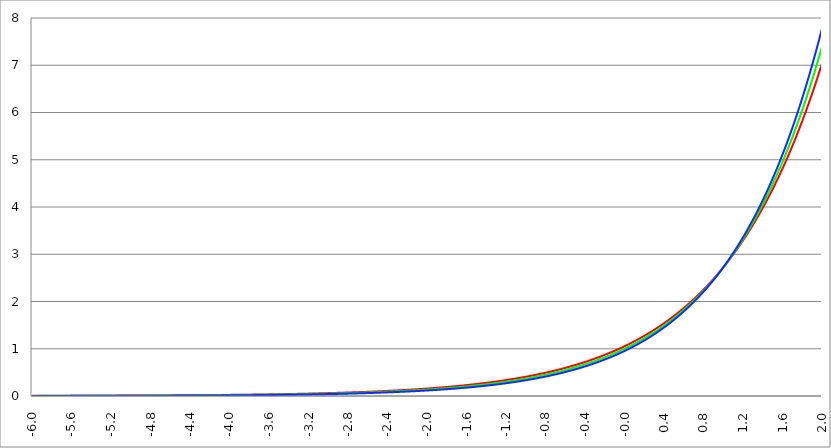
| Category | Series 1 | Series 0 | Series 2 |
|---|---|---|---|
| -6.0 | 0.004 | 0.002 | 0.002 |
| -5.996 | 0.004 | 0.002 | 0.002 |
| -5.992000000000001 | 0.004 | 0.002 | 0.002 |
| -5.988000000000001 | 0.004 | 0.003 | 0.002 |
| -5.984000000000002 | 0.004 | 0.003 | 0.002 |
| -5.980000000000002 | 0.004 | 0.003 | 0.002 |
| -5.976000000000002 | 0.004 | 0.003 | 0.002 |
| -5.972000000000003 | 0.004 | 0.003 | 0.002 |
| -5.968000000000003 | 0.004 | 0.003 | 0.002 |
| -5.964000000000004 | 0.004 | 0.003 | 0.002 |
| -5.960000000000004 | 0.004 | 0.003 | 0.002 |
| -5.956000000000004 | 0.004 | 0.003 | 0.002 |
| -5.952000000000005 | 0.004 | 0.003 | 0.002 |
| -5.948000000000005 | 0.004 | 0.003 | 0.002 |
| -5.944000000000006 | 0.004 | 0.003 | 0.002 |
| -5.940000000000006 | 0.004 | 0.003 | 0.002 |
| -5.936000000000007 | 0.004 | 0.003 | 0.002 |
| -5.932000000000007 | 0.004 | 0.003 | 0.002 |
| -5.928000000000008 | 0.004 | 0.003 | 0.002 |
| -5.924000000000008 | 0.004 | 0.003 | 0.002 |
| -5.920000000000009 | 0.004 | 0.003 | 0.002 |
| -5.91600000000001 | 0.004 | 0.003 | 0.002 |
| -5.91200000000001 | 0.004 | 0.003 | 0.002 |
| -5.90800000000001 | 0.004 | 0.003 | 0.002 |
| -5.904000000000011 | 0.004 | 0.003 | 0.002 |
| -5.900000000000011 | 0.004 | 0.003 | 0.002 |
| -5.896000000000011 | 0.004 | 0.003 | 0.002 |
| -5.892000000000012 | 0.004 | 0.003 | 0.002 |
| -5.888000000000012 | 0.004 | 0.003 | 0.002 |
| -5.884000000000013 | 0.004 | 0.003 | 0.002 |
| -5.880000000000013 | 0.004 | 0.003 | 0.002 |
| -5.876000000000014 | 0.004 | 0.003 | 0.002 |
| -5.872000000000014 | 0.004 | 0.003 | 0.002 |
| -5.868000000000014 | 0.004 | 0.003 | 0.002 |
| -5.864000000000015 | 0.004 | 0.003 | 0.002 |
| -5.860000000000015 | 0.004 | 0.003 | 0.002 |
| -5.856000000000016 | 0.004 | 0.003 | 0.002 |
| -5.852000000000016 | 0.004 | 0.003 | 0.002 |
| -5.848000000000017 | 0.004 | 0.003 | 0.002 |
| -5.844000000000017 | 0.004 | 0.003 | 0.002 |
| -5.840000000000018 | 0.004 | 0.003 | 0.002 |
| -5.836000000000018 | 0.004 | 0.003 | 0.002 |
| -5.832000000000018 | 0.004 | 0.003 | 0.002 |
| -5.828000000000019 | 0.004 | 0.003 | 0.002 |
| -5.824000000000019 | 0.004 | 0.003 | 0.002 |
| -5.82000000000002 | 0.004 | 0.003 | 0.002 |
| -5.81600000000002 | 0.004 | 0.003 | 0.002 |
| -5.812000000000021 | 0.004 | 0.003 | 0.002 |
| -5.808000000000021 | 0.004 | 0.003 | 0.002 |
| -5.804000000000022 | 0.004 | 0.003 | 0.002 |
| -5.800000000000022 | 0.004 | 0.003 | 0.002 |
| -5.796000000000022 | 0.004 | 0.003 | 0.002 |
| -5.792000000000023 | 0.004 | 0.003 | 0.002 |
| -5.788000000000023 | 0.004 | 0.003 | 0.002 |
| -5.784000000000024 | 0.004 | 0.003 | 0.002 |
| -5.780000000000024 | 0.004 | 0.003 | 0.002 |
| -5.776000000000024 | 0.004 | 0.003 | 0.002 |
| -5.772000000000025 | 0.004 | 0.003 | 0.002 |
| -5.768000000000025 | 0.004 | 0.003 | 0.002 |
| -5.764000000000026 | 0.004 | 0.003 | 0.002 |
| -5.760000000000026 | 0.004 | 0.003 | 0.002 |
| -5.756000000000026 | 0.004 | 0.003 | 0.002 |
| -5.752000000000027 | 0.004 | 0.003 | 0.002 |
| -5.748000000000027 | 0.004 | 0.003 | 0.002 |
| -5.744000000000028 | 0.004 | 0.003 | 0.002 |
| -5.740000000000028 | 0.005 | 0.003 | 0.002 |
| -5.73600000000003 | 0.005 | 0.003 | 0.002 |
| -5.73200000000003 | 0.005 | 0.003 | 0.002 |
| -5.72800000000003 | 0.005 | 0.003 | 0.002 |
| -5.72400000000003 | 0.005 | 0.003 | 0.002 |
| -5.720000000000031 | 0.005 | 0.003 | 0.002 |
| -5.716000000000031 | 0.005 | 0.003 | 0.002 |
| -5.712000000000032 | 0.005 | 0.003 | 0.002 |
| -5.708000000000032 | 0.005 | 0.003 | 0.002 |
| -5.704000000000033 | 0.005 | 0.003 | 0.002 |
| -5.700000000000033 | 0.005 | 0.003 | 0.002 |
| -5.696000000000033 | 0.005 | 0.003 | 0.002 |
| -5.692000000000034 | 0.005 | 0.003 | 0.002 |
| -5.688000000000034 | 0.005 | 0.003 | 0.002 |
| -5.684000000000035 | 0.005 | 0.003 | 0.002 |
| -5.680000000000035 | 0.005 | 0.003 | 0.002 |
| -5.676000000000035 | 0.005 | 0.003 | 0.002 |
| -5.672000000000036 | 0.005 | 0.003 | 0.002 |
| -5.668000000000036 | 0.005 | 0.003 | 0.002 |
| -5.664000000000037 | 0.005 | 0.003 | 0.002 |
| -5.660000000000037 | 0.005 | 0.003 | 0.002 |
| -5.656000000000038 | 0.005 | 0.003 | 0.003 |
| -5.652000000000038 | 0.005 | 0.004 | 0.003 |
| -5.648000000000039 | 0.005 | 0.004 | 0.003 |
| -5.644000000000039 | 0.005 | 0.004 | 0.003 |
| -5.64000000000004 | 0.005 | 0.004 | 0.003 |
| -5.63600000000004 | 0.005 | 0.004 | 0.003 |
| -5.63200000000004 | 0.005 | 0.004 | 0.003 |
| -5.628000000000041 | 0.005 | 0.004 | 0.003 |
| -5.624000000000041 | 0.005 | 0.004 | 0.003 |
| -5.620000000000042 | 0.005 | 0.004 | 0.003 |
| -5.616000000000042 | 0.005 | 0.004 | 0.003 |
| -5.612000000000043 | 0.005 | 0.004 | 0.003 |
| -5.608000000000043 | 0.005 | 0.004 | 0.003 |
| -5.604000000000044 | 0.005 | 0.004 | 0.003 |
| -5.600000000000044 | 0.005 | 0.004 | 0.003 |
| -5.596000000000044 | 0.005 | 0.004 | 0.003 |
| -5.592000000000045 | 0.005 | 0.004 | 0.003 |
| -5.588000000000045 | 0.005 | 0.004 | 0.003 |
| -5.584000000000046 | 0.005 | 0.004 | 0.003 |
| -5.580000000000046 | 0.005 | 0.004 | 0.003 |
| -5.576000000000046 | 0.005 | 0.004 | 0.003 |
| -5.572000000000047 | 0.005 | 0.004 | 0.003 |
| -5.568000000000048 | 0.005 | 0.004 | 0.003 |
| -5.564000000000048 | 0.005 | 0.004 | 0.003 |
| -5.560000000000048 | 0.005 | 0.004 | 0.003 |
| -5.556000000000049 | 0.005 | 0.004 | 0.003 |
| -5.552000000000049 | 0.005 | 0.004 | 0.003 |
| -5.54800000000005 | 0.005 | 0.004 | 0.003 |
| -5.54400000000005 | 0.005 | 0.004 | 0.003 |
| -5.540000000000051 | 0.005 | 0.004 | 0.003 |
| -5.536000000000051 | 0.005 | 0.004 | 0.003 |
| -5.532000000000052 | 0.005 | 0.004 | 0.003 |
| -5.528000000000052 | 0.006 | 0.004 | 0.003 |
| -5.524000000000052 | 0.006 | 0.004 | 0.003 |
| -5.520000000000053 | 0.006 | 0.004 | 0.003 |
| -5.516000000000053 | 0.006 | 0.004 | 0.003 |
| -5.512000000000054 | 0.006 | 0.004 | 0.003 |
| -5.508000000000054 | 0.006 | 0.004 | 0.003 |
| -5.504000000000055 | 0.006 | 0.004 | 0.003 |
| -5.500000000000055 | 0.006 | 0.004 | 0.003 |
| -5.496000000000055 | 0.006 | 0.004 | 0.003 |
| -5.492000000000056 | 0.006 | 0.004 | 0.003 |
| -5.488000000000056 | 0.006 | 0.004 | 0.003 |
| -5.484000000000057 | 0.006 | 0.004 | 0.003 |
| -5.480000000000057 | 0.006 | 0.004 | 0.003 |
| -5.476000000000057 | 0.006 | 0.004 | 0.003 |
| -5.472000000000058 | 0.006 | 0.004 | 0.003 |
| -5.468000000000059 | 0.006 | 0.004 | 0.003 |
| -5.464000000000059 | 0.006 | 0.004 | 0.003 |
| -5.460000000000059 | 0.006 | 0.004 | 0.003 |
| -5.45600000000006 | 0.006 | 0.004 | 0.003 |
| -5.45200000000006 | 0.006 | 0.004 | 0.003 |
| -5.44800000000006 | 0.006 | 0.004 | 0.003 |
| -5.444000000000061 | 0.006 | 0.004 | 0.003 |
| -5.440000000000061 | 0.006 | 0.004 | 0.003 |
| -5.436000000000062 | 0.006 | 0.004 | 0.003 |
| -5.432000000000062 | 0.006 | 0.004 | 0.003 |
| -5.428000000000063 | 0.006 | 0.004 | 0.003 |
| -5.424000000000063 | 0.006 | 0.004 | 0.003 |
| -5.420000000000064 | 0.006 | 0.004 | 0.003 |
| -5.416000000000064 | 0.006 | 0.004 | 0.003 |
| -5.412000000000064 | 0.006 | 0.004 | 0.003 |
| -5.408000000000065 | 0.006 | 0.004 | 0.003 |
| -5.404000000000065 | 0.006 | 0.004 | 0.003 |
| -5.400000000000066 | 0.006 | 0.005 | 0.003 |
| -5.396000000000066 | 0.006 | 0.005 | 0.003 |
| -5.392000000000067 | 0.006 | 0.005 | 0.003 |
| -5.388000000000067 | 0.006 | 0.005 | 0.003 |
| -5.384000000000068 | 0.006 | 0.005 | 0.003 |
| -5.380000000000068 | 0.006 | 0.005 | 0.003 |
| -5.376000000000068 | 0.006 | 0.005 | 0.003 |
| -5.37200000000007 | 0.006 | 0.005 | 0.003 |
| -5.36800000000007 | 0.006 | 0.005 | 0.003 |
| -5.36400000000007 | 0.006 | 0.005 | 0.003 |
| -5.36000000000007 | 0.006 | 0.005 | 0.003 |
| -5.356000000000071 | 0.006 | 0.005 | 0.003 |
| -5.352000000000071 | 0.007 | 0.005 | 0.003 |
| -5.348000000000072 | 0.007 | 0.005 | 0.003 |
| -5.344000000000072 | 0.007 | 0.005 | 0.003 |
| -5.340000000000073 | 0.007 | 0.005 | 0.003 |
| -5.336000000000073 | 0.007 | 0.005 | 0.004 |
| -5.332000000000074 | 0.007 | 0.005 | 0.004 |
| -5.328000000000074 | 0.007 | 0.005 | 0.004 |
| -5.324000000000074 | 0.007 | 0.005 | 0.004 |
| -5.320000000000075 | 0.007 | 0.005 | 0.004 |
| -5.316000000000075 | 0.007 | 0.005 | 0.004 |
| -5.312000000000076 | 0.007 | 0.005 | 0.004 |
| -5.308000000000076 | 0.007 | 0.005 | 0.004 |
| -5.304000000000077 | 0.007 | 0.005 | 0.004 |
| -5.300000000000077 | 0.007 | 0.005 | 0.004 |
| -5.296000000000077 | 0.007 | 0.005 | 0.004 |
| -5.292000000000078 | 0.007 | 0.005 | 0.004 |
| -5.288000000000078 | 0.007 | 0.005 | 0.004 |
| -5.284000000000079 | 0.007 | 0.005 | 0.004 |
| -5.28000000000008 | 0.007 | 0.005 | 0.004 |
| -5.27600000000008 | 0.007 | 0.005 | 0.004 |
| -5.27200000000008 | 0.007 | 0.005 | 0.004 |
| -5.268000000000081 | 0.007 | 0.005 | 0.004 |
| -5.264000000000081 | 0.007 | 0.005 | 0.004 |
| -5.260000000000081 | 0.007 | 0.005 | 0.004 |
| -5.256000000000082 | 0.007 | 0.005 | 0.004 |
| -5.252000000000082 | 0.007 | 0.005 | 0.004 |
| -5.248000000000083 | 0.007 | 0.005 | 0.004 |
| -5.244000000000083 | 0.007 | 0.005 | 0.004 |
| -5.240000000000084 | 0.007 | 0.005 | 0.004 |
| -5.236000000000084 | 0.007 | 0.005 | 0.004 |
| -5.232000000000084 | 0.007 | 0.005 | 0.004 |
| -5.228000000000085 | 0.007 | 0.005 | 0.004 |
| -5.224000000000085 | 0.007 | 0.005 | 0.004 |
| -5.220000000000086 | 0.007 | 0.005 | 0.004 |
| -5.216000000000086 | 0.007 | 0.005 | 0.004 |
| -5.212000000000087 | 0.007 | 0.005 | 0.004 |
| -5.208000000000087 | 0.007 | 0.005 | 0.004 |
| -5.204000000000088 | 0.008 | 0.005 | 0.004 |
| -5.200000000000088 | 0.008 | 0.006 | 0.004 |
| -5.196000000000089 | 0.008 | 0.006 | 0.004 |
| -5.192000000000089 | 0.008 | 0.006 | 0.004 |
| -5.188000000000089 | 0.008 | 0.006 | 0.004 |
| -5.18400000000009 | 0.008 | 0.006 | 0.004 |
| -5.18000000000009 | 0.008 | 0.006 | 0.004 |
| -5.176000000000091 | 0.008 | 0.006 | 0.004 |
| -5.172000000000091 | 0.008 | 0.006 | 0.004 |
| -5.168000000000092 | 0.008 | 0.006 | 0.004 |
| -5.164000000000092 | 0.008 | 0.006 | 0.004 |
| -5.160000000000092 | 0.008 | 0.006 | 0.004 |
| -5.156000000000093 | 0.008 | 0.006 | 0.004 |
| -5.152000000000093 | 0.008 | 0.006 | 0.004 |
| -5.148000000000094 | 0.008 | 0.006 | 0.004 |
| -5.144000000000094 | 0.008 | 0.006 | 0.004 |
| -5.140000000000095 | 0.008 | 0.006 | 0.004 |
| -5.136000000000095 | 0.008 | 0.006 | 0.004 |
| -5.132000000000096 | 0.008 | 0.006 | 0.004 |
| -5.128000000000096 | 0.008 | 0.006 | 0.004 |
| -5.124000000000096 | 0.008 | 0.006 | 0.004 |
| -5.120000000000097 | 0.008 | 0.006 | 0.004 |
| -5.116000000000097 | 0.008 | 0.006 | 0.004 |
| -5.112000000000098 | 0.008 | 0.006 | 0.004 |
| -5.108000000000098 | 0.008 | 0.006 | 0.004 |
| -5.104000000000099 | 0.008 | 0.006 | 0.004 |
| -5.100000000000099 | 0.008 | 0.006 | 0.004 |
| -5.0960000000001 | 0.008 | 0.006 | 0.005 |
| -5.0920000000001 | 0.008 | 0.006 | 0.005 |
| -5.0880000000001 | 0.008 | 0.006 | 0.005 |
| -5.084000000000101 | 0.008 | 0.006 | 0.005 |
| -5.080000000000101 | 0.008 | 0.006 | 0.005 |
| -5.076000000000101 | 0.008 | 0.006 | 0.005 |
| -5.072000000000102 | 0.009 | 0.006 | 0.005 |
| -5.068000000000103 | 0.009 | 0.006 | 0.005 |
| -5.064000000000103 | 0.009 | 0.006 | 0.005 |
| -5.060000000000104 | 0.009 | 0.006 | 0.005 |
| -5.056000000000104 | 0.009 | 0.006 | 0.005 |
| -5.052000000000104 | 0.009 | 0.006 | 0.005 |
| -5.048000000000104 | 0.009 | 0.006 | 0.005 |
| -5.044000000000105 | 0.009 | 0.006 | 0.005 |
| -5.040000000000105 | 0.009 | 0.006 | 0.005 |
| -5.036000000000106 | 0.009 | 0.006 | 0.005 |
| -5.032000000000106 | 0.009 | 0.007 | 0.005 |
| -5.028000000000107 | 0.009 | 0.007 | 0.005 |
| -5.024000000000107 | 0.009 | 0.007 | 0.005 |
| -5.020000000000108 | 0.009 | 0.007 | 0.005 |
| -5.016000000000108 | 0.009 | 0.007 | 0.005 |
| -5.012000000000109 | 0.009 | 0.007 | 0.005 |
| -5.00800000000011 | 0.009 | 0.007 | 0.005 |
| -5.00400000000011 | 0.009 | 0.007 | 0.005 |
| -5.00000000000011 | 0.009 | 0.007 | 0.005 |
| -4.99600000000011 | 0.009 | 0.007 | 0.005 |
| -4.992000000000111 | 0.009 | 0.007 | 0.005 |
| -4.988000000000111 | 0.009 | 0.007 | 0.005 |
| -4.984000000000112 | 0.009 | 0.007 | 0.005 |
| -4.980000000000112 | 0.009 | 0.007 | 0.005 |
| -4.976000000000112 | 0.009 | 0.007 | 0.005 |
| -4.972000000000113 | 0.009 | 0.007 | 0.005 |
| -4.968000000000114 | 0.009 | 0.007 | 0.005 |
| -4.964000000000114 | 0.009 | 0.007 | 0.005 |
| -4.960000000000114 | 0.009 | 0.007 | 0.005 |
| -4.956000000000114 | 0.009 | 0.007 | 0.005 |
| -4.952000000000115 | 0.01 | 0.007 | 0.005 |
| -4.948000000000115 | 0.01 | 0.007 | 0.005 |
| -4.944000000000116 | 0.01 | 0.007 | 0.005 |
| -4.940000000000116 | 0.01 | 0.007 | 0.005 |
| -4.936000000000117 | 0.01 | 0.007 | 0.005 |
| -4.932000000000117 | 0.01 | 0.007 | 0.005 |
| -4.928000000000118 | 0.01 | 0.007 | 0.005 |
| -4.924000000000118 | 0.01 | 0.007 | 0.005 |
| -4.920000000000119 | 0.01 | 0.007 | 0.005 |
| -4.91600000000012 | 0.01 | 0.007 | 0.005 |
| -4.91200000000012 | 0.01 | 0.007 | 0.005 |
| -4.90800000000012 | 0.01 | 0.007 | 0.006 |
| -4.90400000000012 | 0.01 | 0.007 | 0.006 |
| -4.90000000000012 | 0.01 | 0.007 | 0.006 |
| -4.896000000000121 | 0.01 | 0.007 | 0.006 |
| -4.892000000000122 | 0.01 | 0.008 | 0.006 |
| -4.888000000000122 | 0.01 | 0.008 | 0.006 |
| -4.884000000000123 | 0.01 | 0.008 | 0.006 |
| -4.880000000000123 | 0.01 | 0.008 | 0.006 |
| -4.876000000000123 | 0.01 | 0.008 | 0.006 |
| -4.872000000000124 | 0.01 | 0.008 | 0.006 |
| -4.868000000000124 | 0.01 | 0.008 | 0.006 |
| -4.864000000000125 | 0.01 | 0.008 | 0.006 |
| -4.860000000000125 | 0.01 | 0.008 | 0.006 |
| -4.856000000000125 | 0.01 | 0.008 | 0.006 |
| -4.852000000000126 | 0.01 | 0.008 | 0.006 |
| -4.848000000000126 | 0.011 | 0.008 | 0.006 |
| -4.844000000000127 | 0.011 | 0.008 | 0.006 |
| -4.840000000000127 | 0.011 | 0.008 | 0.006 |
| -4.836000000000128 | 0.011 | 0.008 | 0.006 |
| -4.832000000000128 | 0.011 | 0.008 | 0.006 |
| -4.82800000000013 | 0.011 | 0.008 | 0.006 |
| -4.824000000000129 | 0.011 | 0.008 | 0.006 |
| -4.82000000000013 | 0.011 | 0.008 | 0.006 |
| -4.81600000000013 | 0.011 | 0.008 | 0.006 |
| -4.812000000000131 | 0.011 | 0.008 | 0.006 |
| -4.808000000000131 | 0.011 | 0.008 | 0.006 |
| -4.804000000000132 | 0.011 | 0.008 | 0.006 |
| -4.800000000000132 | 0.011 | 0.008 | 0.006 |
| -4.796000000000132 | 0.011 | 0.008 | 0.006 |
| -4.792000000000133 | 0.011 | 0.008 | 0.006 |
| -4.788000000000133 | 0.011 | 0.008 | 0.006 |
| -4.784000000000134 | 0.011 | 0.008 | 0.006 |
| -4.780000000000134 | 0.011 | 0.008 | 0.006 |
| -4.776000000000134 | 0.011 | 0.008 | 0.006 |
| -4.772000000000135 | 0.011 | 0.008 | 0.006 |
| -4.768000000000135 | 0.011 | 0.008 | 0.006 |
| -4.764000000000136 | 0.011 | 0.009 | 0.006 |
| -4.760000000000136 | 0.011 | 0.009 | 0.006 |
| -4.756000000000136 | 0.011 | 0.009 | 0.006 |
| -4.752000000000137 | 0.012 | 0.009 | 0.006 |
| -4.748000000000137 | 0.012 | 0.009 | 0.007 |
| -4.744000000000138 | 0.012 | 0.009 | 0.007 |
| -4.740000000000138 | 0.012 | 0.009 | 0.007 |
| -4.73600000000014 | 0.012 | 0.009 | 0.007 |
| -4.73200000000014 | 0.012 | 0.009 | 0.007 |
| -4.72800000000014 | 0.012 | 0.009 | 0.007 |
| -4.72400000000014 | 0.012 | 0.009 | 0.007 |
| -4.720000000000141 | 0.012 | 0.009 | 0.007 |
| -4.716000000000141 | 0.012 | 0.009 | 0.007 |
| -4.712000000000142 | 0.012 | 0.009 | 0.007 |
| -4.708000000000142 | 0.012 | 0.009 | 0.007 |
| -4.704000000000143 | 0.012 | 0.009 | 0.007 |
| -4.700000000000143 | 0.012 | 0.009 | 0.007 |
| -4.696000000000143 | 0.012 | 0.009 | 0.007 |
| -4.692000000000144 | 0.012 | 0.009 | 0.007 |
| -4.688000000000144 | 0.012 | 0.009 | 0.007 |
| -4.684000000000145 | 0.012 | 0.009 | 0.007 |
| -4.680000000000145 | 0.012 | 0.009 | 0.007 |
| -4.676000000000145 | 0.012 | 0.009 | 0.007 |
| -4.672000000000146 | 0.012 | 0.009 | 0.007 |
| -4.668000000000147 | 0.012 | 0.009 | 0.007 |
| -4.664000000000147 | 0.013 | 0.009 | 0.007 |
| -4.660000000000147 | 0.013 | 0.009 | 0.007 |
| -4.656000000000148 | 0.013 | 0.01 | 0.007 |
| -4.652000000000148 | 0.013 | 0.01 | 0.007 |
| -4.648000000000149 | 0.013 | 0.01 | 0.007 |
| -4.644000000000149 | 0.013 | 0.01 | 0.007 |
| -4.64000000000015 | 0.013 | 0.01 | 0.007 |
| -4.63600000000015 | 0.013 | 0.01 | 0.007 |
| -4.632000000000151 | 0.013 | 0.01 | 0.007 |
| -4.628000000000151 | 0.013 | 0.01 | 0.007 |
| -4.624000000000151 | 0.013 | 0.01 | 0.007 |
| -4.620000000000152 | 0.013 | 0.01 | 0.007 |
| -4.616000000000152 | 0.013 | 0.01 | 0.007 |
| -4.612000000000153 | 0.013 | 0.01 | 0.008 |
| -4.608000000000153 | 0.013 | 0.01 | 0.008 |
| -4.604000000000154 | 0.013 | 0.01 | 0.008 |
| -4.600000000000154 | 0.013 | 0.01 | 0.008 |
| -4.596000000000154 | 0.013 | 0.01 | 0.008 |
| -4.592000000000155 | 0.013 | 0.01 | 0.008 |
| -4.588000000000155 | 0.013 | 0.01 | 0.008 |
| -4.584000000000156 | 0.014 | 0.01 | 0.008 |
| -4.580000000000156 | 0.014 | 0.01 | 0.008 |
| -4.576000000000156 | 0.014 | 0.01 | 0.008 |
| -4.572000000000157 | 0.014 | 0.01 | 0.008 |
| -4.568000000000158 | 0.014 | 0.01 | 0.008 |
| -4.564000000000158 | 0.014 | 0.01 | 0.008 |
| -4.560000000000159 | 0.014 | 0.01 | 0.008 |
| -4.55600000000016 | 0.014 | 0.011 | 0.008 |
| -4.552000000000159 | 0.014 | 0.011 | 0.008 |
| -4.54800000000016 | 0.014 | 0.011 | 0.008 |
| -4.54400000000016 | 0.014 | 0.011 | 0.008 |
| -4.54000000000016 | 0.014 | 0.011 | 0.008 |
| -4.53600000000016 | 0.014 | 0.011 | 0.008 |
| -4.532000000000161 | 0.014 | 0.011 | 0.008 |
| -4.528000000000162 | 0.014 | 0.011 | 0.008 |
| -4.524000000000163 | 0.014 | 0.011 | 0.008 |
| -4.520000000000163 | 0.014 | 0.011 | 0.008 |
| -4.516000000000163 | 0.014 | 0.011 | 0.008 |
| -4.512000000000164 | 0.014 | 0.011 | 0.008 |
| -4.508000000000164 | 0.015 | 0.011 | 0.008 |
| -4.504000000000164 | 0.015 | 0.011 | 0.008 |
| -4.500000000000165 | 0.015 | 0.011 | 0.008 |
| -4.496000000000165 | 0.015 | 0.011 | 0.008 |
| -4.492000000000166 | 0.015 | 0.011 | 0.009 |
| -4.488000000000166 | 0.015 | 0.011 | 0.009 |
| -4.484000000000166 | 0.015 | 0.011 | 0.009 |
| -4.480000000000167 | 0.015 | 0.011 | 0.009 |
| -4.476000000000167 | 0.015 | 0.011 | 0.009 |
| -4.472000000000168 | 0.015 | 0.011 | 0.009 |
| -4.468000000000168 | 0.015 | 0.011 | 0.009 |
| -4.46400000000017 | 0.015 | 0.012 | 0.009 |
| -4.46000000000017 | 0.015 | 0.012 | 0.009 |
| -4.45600000000017 | 0.015 | 0.012 | 0.009 |
| -4.45200000000017 | 0.015 | 0.012 | 0.009 |
| -4.44800000000017 | 0.015 | 0.012 | 0.009 |
| -4.444000000000171 | 0.015 | 0.012 | 0.009 |
| -4.440000000000171 | 0.016 | 0.012 | 0.009 |
| -4.436000000000172 | 0.016 | 0.012 | 0.009 |
| -4.432000000000172 | 0.016 | 0.012 | 0.009 |
| -4.428000000000173 | 0.016 | 0.012 | 0.009 |
| -4.424000000000174 | 0.016 | 0.012 | 0.009 |
| -4.420000000000174 | 0.016 | 0.012 | 0.009 |
| -4.416000000000174 | 0.016 | 0.012 | 0.009 |
| -4.412000000000174 | 0.016 | 0.012 | 0.009 |
| -4.408000000000175 | 0.016 | 0.012 | 0.009 |
| -4.404000000000175 | 0.016 | 0.012 | 0.009 |
| -4.400000000000176 | 0.016 | 0.012 | 0.009 |
| -4.396000000000176 | 0.016 | 0.012 | 0.009 |
| -4.392000000000177 | 0.016 | 0.012 | 0.009 |
| -4.388000000000177 | 0.016 | 0.012 | 0.01 |
| -4.384000000000178 | 0.016 | 0.012 | 0.01 |
| -4.380000000000178 | 0.016 | 0.013 | 0.01 |
| -4.376000000000178 | 0.016 | 0.013 | 0.01 |
| -4.37200000000018 | 0.017 | 0.013 | 0.01 |
| -4.36800000000018 | 0.017 | 0.013 | 0.01 |
| -4.36400000000018 | 0.017 | 0.013 | 0.01 |
| -4.360000000000181 | 0.017 | 0.013 | 0.01 |
| -4.356000000000181 | 0.017 | 0.013 | 0.01 |
| -4.352000000000181 | 0.017 | 0.013 | 0.01 |
| -4.348000000000182 | 0.017 | 0.013 | 0.01 |
| -4.344000000000182 | 0.017 | 0.013 | 0.01 |
| -4.340000000000183 | 0.017 | 0.013 | 0.01 |
| -4.336000000000183 | 0.017 | 0.013 | 0.01 |
| -4.332000000000184 | 0.017 | 0.013 | 0.01 |
| -4.328000000000184 | 0.017 | 0.013 | 0.01 |
| -4.324000000000185 | 0.017 | 0.013 | 0.01 |
| -4.320000000000185 | 0.017 | 0.013 | 0.01 |
| -4.316000000000185 | 0.017 | 0.013 | 0.01 |
| -4.312000000000186 | 0.018 | 0.013 | 0.01 |
| -4.308000000000186 | 0.018 | 0.013 | 0.01 |
| -4.304000000000187 | 0.018 | 0.014 | 0.01 |
| -4.300000000000187 | 0.018 | 0.014 | 0.01 |
| -4.296000000000187 | 0.018 | 0.014 | 0.01 |
| -4.292000000000188 | 0.018 | 0.014 | 0.011 |
| -4.288000000000188 | 0.018 | 0.014 | 0.011 |
| -4.284000000000189 | 0.018 | 0.014 | 0.011 |
| -4.28000000000019 | 0.018 | 0.014 | 0.011 |
| -4.27600000000019 | 0.018 | 0.014 | 0.011 |
| -4.27200000000019 | 0.018 | 0.014 | 0.011 |
| -4.268000000000191 | 0.018 | 0.014 | 0.011 |
| -4.264000000000191 | 0.018 | 0.014 | 0.011 |
| -4.260000000000192 | 0.018 | 0.014 | 0.011 |
| -4.256000000000192 | 0.018 | 0.014 | 0.011 |
| -4.252000000000192 | 0.019 | 0.014 | 0.011 |
| -4.248000000000193 | 0.019 | 0.014 | 0.011 |
| -4.244000000000193 | 0.019 | 0.014 | 0.011 |
| -4.240000000000194 | 0.019 | 0.014 | 0.011 |
| -4.236000000000194 | 0.019 | 0.014 | 0.011 |
| -4.232000000000194 | 0.019 | 0.015 | 0.011 |
| -4.228000000000195 | 0.019 | 0.015 | 0.011 |
| -4.224000000000196 | 0.019 | 0.015 | 0.011 |
| -4.220000000000196 | 0.019 | 0.015 | 0.011 |
| -4.216000000000196 | 0.019 | 0.015 | 0.011 |
| -4.212000000000197 | 0.019 | 0.015 | 0.011 |
| -4.208000000000197 | 0.019 | 0.015 | 0.011 |
| -4.204000000000198 | 0.019 | 0.015 | 0.012 |
| -4.200000000000198 | 0.019 | 0.015 | 0.012 |
| -4.196000000000199 | 0.02 | 0.015 | 0.012 |
| -4.192000000000199 | 0.02 | 0.015 | 0.012 |
| -4.1880000000002 | 0.02 | 0.015 | 0.012 |
| -4.1840000000002 | 0.02 | 0.015 | 0.012 |
| -4.1800000000002 | 0.02 | 0.015 | 0.012 |
| -4.176000000000201 | 0.02 | 0.015 | 0.012 |
| -4.172000000000201 | 0.02 | 0.015 | 0.012 |
| -4.168000000000202 | 0.02 | 0.015 | 0.012 |
| -4.164000000000202 | 0.02 | 0.016 | 0.012 |
| -4.160000000000203 | 0.02 | 0.016 | 0.012 |
| -4.156000000000203 | 0.02 | 0.016 | 0.012 |
| -4.152000000000204 | 0.02 | 0.016 | 0.012 |
| -4.148000000000204 | 0.02 | 0.016 | 0.012 |
| -4.144000000000204 | 0.021 | 0.016 | 0.012 |
| -4.140000000000205 | 0.021 | 0.016 | 0.012 |
| -4.136000000000205 | 0.021 | 0.016 | 0.012 |
| -4.132000000000206 | 0.021 | 0.016 | 0.012 |
| -4.128000000000206 | 0.021 | 0.016 | 0.012 |
| -4.124000000000207 | 0.021 | 0.016 | 0.013 |
| -4.120000000000207 | 0.021 | 0.016 | 0.013 |
| -4.116000000000207 | 0.021 | 0.016 | 0.013 |
| -4.112000000000208 | 0.021 | 0.016 | 0.013 |
| -4.108000000000208 | 0.021 | 0.016 | 0.013 |
| -4.104000000000209 | 0.021 | 0.017 | 0.013 |
| -4.100000000000209 | 0.021 | 0.017 | 0.013 |
| -4.09600000000021 | 0.021 | 0.017 | 0.013 |
| -4.09200000000021 | 0.022 | 0.017 | 0.013 |
| -4.088000000000211 | 0.022 | 0.017 | 0.013 |
| -4.084000000000211 | 0.022 | 0.017 | 0.013 |
| -4.080000000000211 | 0.022 | 0.017 | 0.013 |
| -4.076000000000212 | 0.022 | 0.017 | 0.013 |
| -4.072000000000212 | 0.022 | 0.017 | 0.013 |
| -4.068000000000213 | 0.022 | 0.017 | 0.013 |
| -4.064000000000213 | 0.022 | 0.017 | 0.013 |
| -4.060000000000214 | 0.022 | 0.017 | 0.013 |
| -4.056000000000214 | 0.022 | 0.017 | 0.013 |
| -4.052000000000215 | 0.022 | 0.017 | 0.014 |
| -4.048000000000215 | 0.022 | 0.017 | 0.014 |
| -4.044000000000215 | 0.023 | 0.018 | 0.014 |
| -4.040000000000216 | 0.023 | 0.018 | 0.014 |
| -4.036000000000216 | 0.023 | 0.018 | 0.014 |
| -4.032000000000217 | 0.023 | 0.018 | 0.014 |
| -4.028000000000217 | 0.023 | 0.018 | 0.014 |
| -4.024000000000218 | 0.023 | 0.018 | 0.014 |
| -4.020000000000218 | 0.023 | 0.018 | 0.014 |
| -4.016000000000219 | 0.023 | 0.018 | 0.014 |
| -4.012000000000219 | 0.023 | 0.018 | 0.014 |
| -4.008000000000219 | 0.023 | 0.018 | 0.014 |
| -4.00400000000022 | 0.023 | 0.018 | 0.014 |
| -4.00000000000022 | 0.024 | 0.018 | 0.014 |
| -3.99600000000022 | 0.024 | 0.018 | 0.014 |
| -3.99200000000022 | 0.024 | 0.018 | 0.014 |
| -3.98800000000022 | 0.024 | 0.019 | 0.014 |
| -3.98400000000022 | 0.024 | 0.019 | 0.015 |
| -3.98000000000022 | 0.024 | 0.019 | 0.015 |
| -3.97600000000022 | 0.024 | 0.019 | 0.015 |
| -3.97200000000022 | 0.024 | 0.019 | 0.015 |
| -3.96800000000022 | 0.024 | 0.019 | 0.015 |
| -3.96400000000022 | 0.024 | 0.019 | 0.015 |
| -3.96000000000022 | 0.024 | 0.019 | 0.015 |
| -3.95600000000022 | 0.025 | 0.019 | 0.015 |
| -3.95200000000022 | 0.025 | 0.019 | 0.015 |
| -3.94800000000022 | 0.025 | 0.019 | 0.015 |
| -3.94400000000022 | 0.025 | 0.019 | 0.015 |
| -3.94000000000022 | 0.025 | 0.019 | 0.015 |
| -3.93600000000022 | 0.025 | 0.02 | 0.015 |
| -3.93200000000022 | 0.025 | 0.02 | 0.015 |
| -3.92800000000022 | 0.025 | 0.02 | 0.015 |
| -3.92400000000022 | 0.025 | 0.02 | 0.015 |
| -3.92000000000022 | 0.025 | 0.02 | 0.016 |
| -3.91600000000022 | 0.026 | 0.02 | 0.016 |
| -3.91200000000022 | 0.026 | 0.02 | 0.016 |
| -3.90800000000022 | 0.026 | 0.02 | 0.016 |
| -3.90400000000022 | 0.026 | 0.02 | 0.016 |
| -3.90000000000022 | 0.026 | 0.02 | 0.016 |
| -3.89600000000022 | 0.026 | 0.02 | 0.016 |
| -3.89200000000022 | 0.026 | 0.02 | 0.016 |
| -3.88800000000022 | 0.026 | 0.02 | 0.016 |
| -3.88400000000022 | 0.026 | 0.021 | 0.016 |
| -3.88000000000022 | 0.026 | 0.021 | 0.016 |
| -3.87600000000022 | 0.026 | 0.021 | 0.016 |
| -3.87200000000022 | 0.027 | 0.021 | 0.016 |
| -3.86800000000022 | 0.027 | 0.021 | 0.016 |
| -3.86400000000022 | 0.027 | 0.021 | 0.016 |
| -3.86000000000022 | 0.027 | 0.021 | 0.017 |
| -3.85600000000022 | 0.027 | 0.021 | 0.017 |
| -3.85200000000022 | 0.027 | 0.021 | 0.017 |
| -3.84800000000022 | 0.027 | 0.021 | 0.017 |
| -3.84400000000022 | 0.027 | 0.021 | 0.017 |
| -3.84000000000022 | 0.027 | 0.021 | 0.017 |
| -3.83600000000022 | 0.028 | 0.022 | 0.017 |
| -3.83200000000022 | 0.028 | 0.022 | 0.017 |
| -3.82800000000022 | 0.028 | 0.022 | 0.017 |
| -3.82400000000022 | 0.028 | 0.022 | 0.017 |
| -3.82000000000022 | 0.028 | 0.022 | 0.017 |
| -3.81600000000022 | 0.028 | 0.022 | 0.017 |
| -3.81200000000022 | 0.028 | 0.022 | 0.017 |
| -3.80800000000022 | 0.028 | 0.022 | 0.017 |
| -3.80400000000022 | 0.028 | 0.022 | 0.018 |
| -3.80000000000022 | 0.028 | 0.022 | 0.018 |
| -3.79600000000022 | 0.029 | 0.022 | 0.018 |
| -3.79200000000022 | 0.029 | 0.023 | 0.018 |
| -3.78800000000022 | 0.029 | 0.023 | 0.018 |
| -3.78400000000022 | 0.029 | 0.023 | 0.018 |
| -3.78000000000022 | 0.029 | 0.023 | 0.018 |
| -3.77600000000022 | 0.029 | 0.023 | 0.018 |
| -3.77200000000022 | 0.029 | 0.023 | 0.018 |
| -3.76800000000022 | 0.029 | 0.023 | 0.018 |
| -3.76400000000022 | 0.029 | 0.023 | 0.018 |
| -3.76000000000022 | 0.03 | 0.023 | 0.018 |
| -3.75600000000022 | 0.03 | 0.023 | 0.018 |
| -3.75200000000022 | 0.03 | 0.023 | 0.019 |
| -3.74800000000022 | 0.03 | 0.024 | 0.019 |
| -3.74400000000022 | 0.03 | 0.024 | 0.019 |
| -3.74000000000022 | 0.03 | 0.024 | 0.019 |
| -3.73600000000022 | 0.03 | 0.024 | 0.019 |
| -3.73200000000022 | 0.03 | 0.024 | 0.019 |
| -3.72800000000022 | 0.03 | 0.024 | 0.019 |
| -3.72400000000022 | 0.031 | 0.024 | 0.019 |
| -3.72000000000022 | 0.031 | 0.024 | 0.019 |
| -3.71600000000022 | 0.031 | 0.024 | 0.019 |
| -3.71200000000022 | 0.031 | 0.024 | 0.019 |
| -3.70800000000022 | 0.031 | 0.025 | 0.019 |
| -3.70400000000022 | 0.031 | 0.025 | 0.019 |
| -3.70000000000022 | 0.031 | 0.025 | 0.02 |
| -3.69600000000022 | 0.031 | 0.025 | 0.02 |
| -3.69200000000022 | 0.032 | 0.025 | 0.02 |
| -3.68800000000022 | 0.032 | 0.025 | 0.02 |
| -3.68400000000022 | 0.032 | 0.025 | 0.02 |
| -3.68000000000022 | 0.032 | 0.025 | 0.02 |
| -3.67600000000022 | 0.032 | 0.025 | 0.02 |
| -3.67200000000022 | 0.032 | 0.025 | 0.02 |
| -3.66800000000022 | 0.032 | 0.026 | 0.02 |
| -3.66400000000022 | 0.032 | 0.026 | 0.02 |
| -3.66000000000022 | 0.033 | 0.026 | 0.02 |
| -3.65600000000022 | 0.033 | 0.026 | 0.02 |
| -3.65200000000022 | 0.033 | 0.026 | 0.021 |
| -3.64800000000022 | 0.033 | 0.026 | 0.021 |
| -3.64400000000022 | 0.033 | 0.026 | 0.021 |
| -3.64000000000022 | 0.033 | 0.026 | 0.021 |
| -3.63600000000022 | 0.033 | 0.026 | 0.021 |
| -3.63200000000022 | 0.033 | 0.026 | 0.021 |
| -3.62800000000022 | 0.034 | 0.027 | 0.021 |
| -3.62400000000022 | 0.034 | 0.027 | 0.021 |
| -3.62000000000022 | 0.034 | 0.027 | 0.021 |
| -3.61600000000022 | 0.034 | 0.027 | 0.021 |
| -3.61200000000022 | 0.034 | 0.027 | 0.021 |
| -3.60800000000022 | 0.034 | 0.027 | 0.022 |
| -3.60400000000022 | 0.034 | 0.027 | 0.022 |
| -3.60000000000022 | 0.034 | 0.027 | 0.022 |
| -3.59600000000022 | 0.035 | 0.027 | 0.022 |
| -3.59200000000022 | 0.035 | 0.028 | 0.022 |
| -3.58800000000022 | 0.035 | 0.028 | 0.022 |
| -3.58400000000022 | 0.035 | 0.028 | 0.022 |
| -3.58000000000022 | 0.035 | 0.028 | 0.022 |
| -3.57600000000022 | 0.035 | 0.028 | 0.022 |
| -3.57200000000022 | 0.035 | 0.028 | 0.022 |
| -3.56800000000022 | 0.035 | 0.028 | 0.022 |
| -3.56400000000022 | 0.036 | 0.028 | 0.023 |
| -3.56000000000022 | 0.036 | 0.028 | 0.023 |
| -3.55600000000022 | 0.036 | 0.029 | 0.023 |
| -3.55200000000022 | 0.036 | 0.029 | 0.023 |
| -3.54800000000022 | 0.036 | 0.029 | 0.023 |
| -3.54400000000022 | 0.036 | 0.029 | 0.023 |
| -3.54000000000022 | 0.036 | 0.029 | 0.023 |
| -3.53600000000022 | 0.037 | 0.029 | 0.023 |
| -3.53200000000022 | 0.037 | 0.029 | 0.023 |
| -3.52800000000022 | 0.037 | 0.029 | 0.023 |
| -3.52400000000022 | 0.037 | 0.029 | 0.024 |
| -3.52000000000022 | 0.037 | 0.03 | 0.024 |
| -3.51600000000022 | 0.037 | 0.03 | 0.024 |
| -3.51200000000022 | 0.037 | 0.03 | 0.024 |
| -3.50800000000022 | 0.038 | 0.03 | 0.024 |
| -3.50400000000022 | 0.038 | 0.03 | 0.024 |
| -3.50000000000022 | 0.038 | 0.03 | 0.024 |
| -3.49600000000022 | 0.038 | 0.03 | 0.024 |
| -3.49200000000022 | 0.038 | 0.03 | 0.024 |
| -3.48800000000022 | 0.038 | 0.031 | 0.024 |
| -3.48400000000022 | 0.038 | 0.031 | 0.025 |
| -3.48000000000022 | 0.039 | 0.031 | 0.025 |
| -3.47600000000022 | 0.039 | 0.031 | 0.025 |
| -3.47200000000022 | 0.039 | 0.031 | 0.025 |
| -3.46800000000022 | 0.039 | 0.031 | 0.025 |
| -3.46400000000022 | 0.039 | 0.031 | 0.025 |
| -3.46000000000022 | 0.039 | 0.031 | 0.025 |
| -3.45600000000022 | 0.039 | 0.032 | 0.025 |
| -3.45200000000022 | 0.04 | 0.032 | 0.025 |
| -3.44800000000022 | 0.04 | 0.032 | 0.025 |
| -3.44400000000022 | 0.04 | 0.032 | 0.026 |
| -3.44000000000022 | 0.04 | 0.032 | 0.026 |
| -3.43600000000022 | 0.04 | 0.032 | 0.026 |
| -3.43200000000022 | 0.04 | 0.032 | 0.026 |
| -3.42800000000022 | 0.041 | 0.032 | 0.026 |
| -3.42400000000022 | 0.041 | 0.033 | 0.026 |
| -3.42000000000022 | 0.041 | 0.033 | 0.026 |
| -3.41600000000022 | 0.041 | 0.033 | 0.026 |
| -3.41200000000022 | 0.041 | 0.033 | 0.026 |
| -3.40800000000022 | 0.041 | 0.033 | 0.027 |
| -3.40400000000022 | 0.041 | 0.033 | 0.027 |
| -3.40000000000022 | 0.042 | 0.033 | 0.027 |
| -3.39600000000022 | 0.042 | 0.034 | 0.027 |
| -3.39200000000022 | 0.042 | 0.034 | 0.027 |
| -3.38800000000022 | 0.042 | 0.034 | 0.027 |
| -3.38400000000022 | 0.042 | 0.034 | 0.027 |
| -3.38000000000022 | 0.042 | 0.034 | 0.027 |
| -3.37600000000022 | 0.043 | 0.034 | 0.027 |
| -3.37200000000022 | 0.043 | 0.034 | 0.028 |
| -3.36800000000022 | 0.043 | 0.034 | 0.028 |
| -3.36400000000022 | 0.043 | 0.035 | 0.028 |
| -3.36000000000022 | 0.043 | 0.035 | 0.028 |
| -3.35600000000022 | 0.043 | 0.035 | 0.028 |
| -3.35200000000022 | 0.044 | 0.035 | 0.028 |
| -3.34800000000022 | 0.044 | 0.035 | 0.028 |
| -3.34400000000022 | 0.044 | 0.035 | 0.028 |
| -3.34000000000022 | 0.044 | 0.035 | 0.029 |
| -3.33600000000022 | 0.044 | 0.036 | 0.029 |
| -3.33200000000022 | 0.044 | 0.036 | 0.029 |
| -3.32800000000022 | 0.045 | 0.036 | 0.029 |
| -3.32400000000022 | 0.045 | 0.036 | 0.029 |
| -3.32000000000022 | 0.045 | 0.036 | 0.029 |
| -3.31600000000022 | 0.045 | 0.036 | 0.029 |
| -3.31200000000022 | 0.045 | 0.036 | 0.029 |
| -3.30800000000022 | 0.045 | 0.037 | 0.03 |
| -3.30400000000022 | 0.046 | 0.037 | 0.03 |
| -3.30000000000022 | 0.046 | 0.037 | 0.03 |
| -3.29600000000022 | 0.046 | 0.037 | 0.03 |
| -3.29200000000022 | 0.046 | 0.037 | 0.03 |
| -3.28800000000022 | 0.046 | 0.037 | 0.03 |
| -3.28400000000022 | 0.046 | 0.037 | 0.03 |
| -3.28000000000022 | 0.047 | 0.038 | 0.03 |
| -3.27600000000022 | 0.047 | 0.038 | 0.031 |
| -3.27200000000022 | 0.047 | 0.038 | 0.031 |
| -3.26800000000022 | 0.047 | 0.038 | 0.031 |
| -3.26400000000022 | 0.047 | 0.038 | 0.031 |
| -3.26000000000022 | 0.048 | 0.038 | 0.031 |
| -3.25600000000022 | 0.048 | 0.039 | 0.031 |
| -3.25200000000022 | 0.048 | 0.039 | 0.031 |
| -3.24800000000022 | 0.048 | 0.039 | 0.031 |
| -3.24400000000022 | 0.048 | 0.039 | 0.032 |
| -3.24000000000022 | 0.048 | 0.039 | 0.032 |
| -3.23600000000022 | 0.049 | 0.039 | 0.032 |
| -3.23200000000022 | 0.049 | 0.039 | 0.032 |
| -3.22800000000022 | 0.049 | 0.04 | 0.032 |
| -3.22400000000022 | 0.049 | 0.04 | 0.032 |
| -3.22000000000022 | 0.049 | 0.04 | 0.032 |
| -3.21600000000022 | 0.05 | 0.04 | 0.033 |
| -3.21200000000022 | 0.05 | 0.04 | 0.033 |
| -3.20800000000022 | 0.05 | 0.04 | 0.033 |
| -3.20400000000022 | 0.05 | 0.041 | 0.033 |
| -3.20000000000022 | 0.05 | 0.041 | 0.033 |
| -3.19600000000022 | 0.051 | 0.041 | 0.033 |
| -3.19200000000022 | 0.051 | 0.041 | 0.033 |
| -3.18800000000022 | 0.051 | 0.041 | 0.034 |
| -3.18400000000022 | 0.051 | 0.041 | 0.034 |
| -3.18000000000022 | 0.051 | 0.042 | 0.034 |
| -3.17600000000022 | 0.052 | 0.042 | 0.034 |
| -3.17200000000022 | 0.052 | 0.042 | 0.034 |
| -3.16800000000022 | 0.052 | 0.042 | 0.034 |
| -3.16400000000022 | 0.052 | 0.042 | 0.034 |
| -3.16000000000022 | 0.052 | 0.042 | 0.035 |
| -3.15600000000022 | 0.053 | 0.043 | 0.035 |
| -3.152000000000219 | 0.053 | 0.043 | 0.035 |
| -3.148000000000219 | 0.053 | 0.043 | 0.035 |
| -3.144000000000219 | 0.053 | 0.043 | 0.035 |
| -3.140000000000219 | 0.053 | 0.043 | 0.035 |
| -3.136000000000219 | 0.054 | 0.043 | 0.035 |
| -3.132000000000219 | 0.054 | 0.044 | 0.036 |
| -3.128000000000219 | 0.054 | 0.044 | 0.036 |
| -3.124000000000219 | 0.054 | 0.044 | 0.036 |
| -3.120000000000219 | 0.054 | 0.044 | 0.036 |
| -3.116000000000219 | 0.055 | 0.044 | 0.036 |
| -3.112000000000219 | 0.055 | 0.045 | 0.036 |
| -3.108000000000219 | 0.055 | 0.045 | 0.036 |
| -3.104000000000219 | 0.055 | 0.045 | 0.037 |
| -3.100000000000219 | 0.055 | 0.045 | 0.037 |
| -3.096000000000219 | 0.056 | 0.045 | 0.037 |
| -3.092000000000219 | 0.056 | 0.045 | 0.037 |
| -3.088000000000219 | 0.056 | 0.046 | 0.037 |
| -3.084000000000219 | 0.056 | 0.046 | 0.037 |
| -3.080000000000219 | 0.056 | 0.046 | 0.038 |
| -3.076000000000219 | 0.057 | 0.046 | 0.038 |
| -3.072000000000219 | 0.057 | 0.046 | 0.038 |
| -3.068000000000219 | 0.057 | 0.047 | 0.038 |
| -3.064000000000219 | 0.057 | 0.047 | 0.038 |
| -3.060000000000219 | 0.058 | 0.047 | 0.038 |
| -3.056000000000219 | 0.058 | 0.047 | 0.038 |
| -3.052000000000219 | 0.058 | 0.047 | 0.039 |
| -3.048000000000219 | 0.058 | 0.047 | 0.039 |
| -3.044000000000219 | 0.058 | 0.048 | 0.039 |
| -3.040000000000219 | 0.059 | 0.048 | 0.039 |
| -3.036000000000219 | 0.059 | 0.048 | 0.039 |
| -3.032000000000219 | 0.059 | 0.048 | 0.039 |
| -3.028000000000219 | 0.059 | 0.048 | 0.04 |
| -3.024000000000219 | 0.06 | 0.049 | 0.04 |
| -3.020000000000219 | 0.06 | 0.049 | 0.04 |
| -3.016000000000219 | 0.06 | 0.049 | 0.04 |
| -3.012000000000219 | 0.06 | 0.049 | 0.04 |
| -3.008000000000219 | 0.06 | 0.049 | 0.04 |
| -3.004000000000219 | 0.061 | 0.05 | 0.041 |
| -3.000000000000219 | 0.061 | 0.05 | 0.041 |
| -2.996000000000219 | 0.061 | 0.05 | 0.041 |
| -2.992000000000219 | 0.061 | 0.05 | 0.041 |
| -2.988000000000219 | 0.062 | 0.05 | 0.041 |
| -2.984000000000219 | 0.062 | 0.051 | 0.042 |
| -2.980000000000219 | 0.062 | 0.051 | 0.042 |
| -2.976000000000219 | 0.062 | 0.051 | 0.042 |
| -2.972000000000219 | 0.063 | 0.051 | 0.042 |
| -2.968000000000219 | 0.063 | 0.051 | 0.042 |
| -2.964000000000219 | 0.063 | 0.052 | 0.042 |
| -2.960000000000219 | 0.063 | 0.052 | 0.043 |
| -2.956000000000219 | 0.063 | 0.052 | 0.043 |
| -2.952000000000219 | 0.064 | 0.052 | 0.043 |
| -2.948000000000219 | 0.064 | 0.052 | 0.043 |
| -2.944000000000219 | 0.064 | 0.053 | 0.043 |
| -2.940000000000219 | 0.064 | 0.053 | 0.043 |
| -2.936000000000219 | 0.065 | 0.053 | 0.044 |
| -2.932000000000219 | 0.065 | 0.053 | 0.044 |
| -2.928000000000219 | 0.065 | 0.054 | 0.044 |
| -2.924000000000219 | 0.065 | 0.054 | 0.044 |
| -2.920000000000219 | 0.066 | 0.054 | 0.044 |
| -2.916000000000219 | 0.066 | 0.054 | 0.045 |
| -2.912000000000219 | 0.066 | 0.054 | 0.045 |
| -2.908000000000219 | 0.066 | 0.055 | 0.045 |
| -2.904000000000219 | 0.067 | 0.055 | 0.045 |
| -2.900000000000219 | 0.067 | 0.055 | 0.045 |
| -2.896000000000219 | 0.067 | 0.055 | 0.046 |
| -2.892000000000219 | 0.067 | 0.055 | 0.046 |
| -2.888000000000219 | 0.068 | 0.056 | 0.046 |
| -2.884000000000219 | 0.068 | 0.056 | 0.046 |
| -2.880000000000219 | 0.068 | 0.056 | 0.046 |
| -2.876000000000219 | 0.069 | 0.056 | 0.046 |
| -2.872000000000219 | 0.069 | 0.057 | 0.047 |
| -2.868000000000219 | 0.069 | 0.057 | 0.047 |
| -2.864000000000219 | 0.069 | 0.057 | 0.047 |
| -2.860000000000219 | 0.07 | 0.057 | 0.047 |
| -2.856000000000219 | 0.07 | 0.057 | 0.047 |
| -2.852000000000219 | 0.07 | 0.058 | 0.048 |
| -2.848000000000219 | 0.07 | 0.058 | 0.048 |
| -2.844000000000219 | 0.071 | 0.058 | 0.048 |
| -2.840000000000219 | 0.071 | 0.058 | 0.048 |
| -2.836000000000219 | 0.071 | 0.059 | 0.048 |
| -2.832000000000219 | 0.071 | 0.059 | 0.049 |
| -2.828000000000219 | 0.072 | 0.059 | 0.049 |
| -2.824000000000219 | 0.072 | 0.059 | 0.049 |
| -2.820000000000219 | 0.072 | 0.06 | 0.049 |
| -2.816000000000219 | 0.073 | 0.06 | 0.05 |
| -2.812000000000219 | 0.073 | 0.06 | 0.05 |
| -2.808000000000219 | 0.073 | 0.06 | 0.05 |
| -2.804000000000219 | 0.073 | 0.061 | 0.05 |
| -2.800000000000219 | 0.074 | 0.061 | 0.05 |
| -2.796000000000219 | 0.074 | 0.061 | 0.051 |
| -2.792000000000219 | 0.074 | 0.061 | 0.051 |
| -2.78800000000022 | 0.074 | 0.062 | 0.051 |
| -2.78400000000022 | 0.075 | 0.062 | 0.051 |
| -2.78000000000022 | 0.075 | 0.062 | 0.051 |
| -2.776000000000219 | 0.075 | 0.062 | 0.052 |
| -2.772000000000219 | 0.076 | 0.063 | 0.052 |
| -2.76800000000022 | 0.076 | 0.063 | 0.052 |
| -2.76400000000022 | 0.076 | 0.063 | 0.052 |
| -2.76000000000022 | 0.076 | 0.063 | 0.053 |
| -2.756000000000219 | 0.077 | 0.064 | 0.053 |
| -2.752000000000219 | 0.077 | 0.064 | 0.053 |
| -2.74800000000022 | 0.077 | 0.064 | 0.053 |
| -2.74400000000022 | 0.078 | 0.064 | 0.053 |
| -2.74000000000022 | 0.078 | 0.065 | 0.054 |
| -2.736000000000219 | 0.078 | 0.065 | 0.054 |
| -2.732000000000219 | 0.079 | 0.065 | 0.054 |
| -2.72800000000022 | 0.079 | 0.065 | 0.054 |
| -2.72400000000022 | 0.079 | 0.066 | 0.055 |
| -2.72000000000022 | 0.079 | 0.066 | 0.055 |
| -2.716000000000219 | 0.08 | 0.066 | 0.055 |
| -2.712000000000219 | 0.08 | 0.066 | 0.055 |
| -2.70800000000022 | 0.08 | 0.067 | 0.055 |
| -2.70400000000022 | 0.081 | 0.067 | 0.056 |
| -2.70000000000022 | 0.081 | 0.067 | 0.056 |
| -2.696000000000219 | 0.081 | 0.067 | 0.056 |
| -2.692000000000219 | 0.082 | 0.068 | 0.056 |
| -2.688000000000219 | 0.082 | 0.068 | 0.057 |
| -2.684000000000219 | 0.082 | 0.068 | 0.057 |
| -2.680000000000219 | 0.083 | 0.069 | 0.057 |
| -2.676000000000219 | 0.083 | 0.069 | 0.057 |
| -2.672000000000219 | 0.083 | 0.069 | 0.058 |
| -2.668000000000219 | 0.083 | 0.069 | 0.058 |
| -2.664000000000219 | 0.084 | 0.07 | 0.058 |
| -2.660000000000219 | 0.084 | 0.07 | 0.058 |
| -2.656000000000219 | 0.084 | 0.07 | 0.059 |
| -2.652000000000219 | 0.085 | 0.071 | 0.059 |
| -2.648000000000219 | 0.085 | 0.071 | 0.059 |
| -2.644000000000219 | 0.085 | 0.071 | 0.059 |
| -2.640000000000219 | 0.086 | 0.071 | 0.06 |
| -2.636000000000219 | 0.086 | 0.072 | 0.06 |
| -2.632000000000219 | 0.086 | 0.072 | 0.06 |
| -2.628000000000219 | 0.087 | 0.072 | 0.06 |
| -2.624000000000219 | 0.087 | 0.073 | 0.061 |
| -2.620000000000219 | 0.087 | 0.073 | 0.061 |
| -2.616000000000219 | 0.088 | 0.073 | 0.061 |
| -2.612000000000219 | 0.088 | 0.073 | 0.061 |
| -2.608000000000219 | 0.088 | 0.074 | 0.062 |
| -2.604000000000219 | 0.089 | 0.074 | 0.062 |
| -2.600000000000219 | 0.089 | 0.074 | 0.062 |
| -2.596000000000219 | 0.089 | 0.075 | 0.062 |
| -2.592000000000219 | 0.09 | 0.075 | 0.063 |
| -2.588000000000219 | 0.09 | 0.075 | 0.063 |
| -2.584000000000219 | 0.09 | 0.075 | 0.063 |
| -2.580000000000219 | 0.091 | 0.076 | 0.063 |
| -2.576000000000219 | 0.091 | 0.076 | 0.064 |
| -2.572000000000219 | 0.091 | 0.076 | 0.064 |
| -2.568000000000219 | 0.092 | 0.077 | 0.064 |
| -2.564000000000219 | 0.092 | 0.077 | 0.065 |
| -2.560000000000219 | 0.092 | 0.077 | 0.065 |
| -2.556000000000219 | 0.093 | 0.078 | 0.065 |
| -2.552000000000219 | 0.093 | 0.078 | 0.065 |
| -2.548000000000219 | 0.094 | 0.078 | 0.066 |
| -2.544000000000219 | 0.094 | 0.079 | 0.066 |
| -2.540000000000219 | 0.094 | 0.079 | 0.066 |
| -2.536000000000219 | 0.095 | 0.079 | 0.066 |
| -2.532000000000219 | 0.095 | 0.079 | 0.067 |
| -2.528000000000219 | 0.095 | 0.08 | 0.067 |
| -2.524000000000219 | 0.096 | 0.08 | 0.067 |
| -2.520000000000219 | 0.096 | 0.08 | 0.068 |
| -2.516000000000219 | 0.096 | 0.081 | 0.068 |
| -2.512000000000219 | 0.097 | 0.081 | 0.068 |
| -2.508000000000219 | 0.097 | 0.081 | 0.068 |
| -2.504000000000219 | 0.098 | 0.082 | 0.069 |
| -2.500000000000219 | 0.098 | 0.082 | 0.069 |
| -2.496000000000219 | 0.098 | 0.082 | 0.069 |
| -2.492000000000219 | 0.099 | 0.083 | 0.07 |
| -2.488000000000219 | 0.099 | 0.083 | 0.07 |
| -2.484000000000219 | 0.099 | 0.083 | 0.07 |
| -2.480000000000219 | 0.1 | 0.084 | 0.07 |
| -2.476000000000219 | 0.1 | 0.084 | 0.071 |
| -2.472000000000219 | 0.101 | 0.084 | 0.071 |
| -2.468000000000219 | 0.101 | 0.085 | 0.071 |
| -2.464000000000219 | 0.101 | 0.085 | 0.072 |
| -2.460000000000219 | 0.102 | 0.085 | 0.072 |
| -2.456000000000219 | 0.102 | 0.086 | 0.072 |
| -2.452000000000219 | 0.102 | 0.086 | 0.073 |
| -2.448000000000219 | 0.103 | 0.086 | 0.073 |
| -2.444000000000219 | 0.103 | 0.087 | 0.073 |
| -2.440000000000219 | 0.104 | 0.087 | 0.073 |
| -2.436000000000219 | 0.104 | 0.088 | 0.074 |
| -2.432000000000219 | 0.104 | 0.088 | 0.074 |
| -2.428000000000219 | 0.105 | 0.088 | 0.074 |
| -2.424000000000219 | 0.105 | 0.089 | 0.075 |
| -2.420000000000219 | 0.106 | 0.089 | 0.075 |
| -2.416000000000219 | 0.106 | 0.089 | 0.075 |
| -2.412000000000219 | 0.106 | 0.09 | 0.076 |
| -2.408000000000219 | 0.107 | 0.09 | 0.076 |
| -2.404000000000219 | 0.107 | 0.09 | 0.076 |
| -2.400000000000219 | 0.108 | 0.091 | 0.077 |
| -2.396000000000219 | 0.108 | 0.091 | 0.077 |
| -2.392000000000219 | 0.108 | 0.091 | 0.077 |
| -2.388000000000219 | 0.109 | 0.092 | 0.078 |
| -2.384000000000219 | 0.109 | 0.092 | 0.078 |
| -2.380000000000219 | 0.11 | 0.093 | 0.078 |
| -2.376000000000219 | 0.11 | 0.093 | 0.079 |
| -2.372000000000219 | 0.111 | 0.093 | 0.079 |
| -2.368000000000219 | 0.111 | 0.094 | 0.079 |
| -2.364000000000219 | 0.111 | 0.094 | 0.08 |
| -2.360000000000219 | 0.112 | 0.094 | 0.08 |
| -2.356000000000219 | 0.112 | 0.095 | 0.08 |
| -2.352000000000219 | 0.113 | 0.095 | 0.081 |
| -2.348000000000219 | 0.113 | 0.096 | 0.081 |
| -2.344000000000219 | 0.114 | 0.096 | 0.081 |
| -2.340000000000219 | 0.114 | 0.096 | 0.082 |
| -2.336000000000219 | 0.114 | 0.097 | 0.082 |
| -2.332000000000219 | 0.115 | 0.097 | 0.082 |
| -2.328000000000219 | 0.115 | 0.097 | 0.083 |
| -2.324000000000219 | 0.116 | 0.098 | 0.083 |
| -2.320000000000219 | 0.116 | 0.098 | 0.083 |
| -2.316000000000219 | 0.117 | 0.099 | 0.084 |
| -2.312000000000219 | 0.117 | 0.099 | 0.084 |
| -2.308000000000219 | 0.118 | 0.099 | 0.084 |
| -2.304000000000219 | 0.118 | 0.1 | 0.085 |
| -2.300000000000219 | 0.118 | 0.1 | 0.085 |
| -2.296000000000219 | 0.119 | 0.101 | 0.085 |
| -2.292000000000219 | 0.119 | 0.101 | 0.086 |
| -2.288000000000219 | 0.12 | 0.101 | 0.086 |
| -2.284000000000219 | 0.12 | 0.102 | 0.087 |
| -2.280000000000219 | 0.121 | 0.102 | 0.087 |
| -2.276000000000219 | 0.121 | 0.103 | 0.087 |
| -2.272000000000219 | 0.122 | 0.103 | 0.088 |
| -2.268000000000219 | 0.122 | 0.104 | 0.088 |
| -2.264000000000219 | 0.123 | 0.104 | 0.088 |
| -2.260000000000219 | 0.123 | 0.104 | 0.089 |
| -2.256000000000219 | 0.123 | 0.105 | 0.089 |
| -2.252000000000219 | 0.124 | 0.105 | 0.09 |
| -2.248000000000219 | 0.124 | 0.106 | 0.09 |
| -2.244000000000219 | 0.125 | 0.106 | 0.09 |
| -2.240000000000219 | 0.125 | 0.106 | 0.091 |
| -2.236000000000219 | 0.126 | 0.107 | 0.091 |
| -2.232000000000219 | 0.126 | 0.107 | 0.091 |
| -2.228000000000219 | 0.127 | 0.108 | 0.092 |
| -2.224000000000219 | 0.127 | 0.108 | 0.092 |
| -2.220000000000219 | 0.128 | 0.109 | 0.093 |
| -2.216000000000219 | 0.128 | 0.109 | 0.093 |
| -2.212000000000219 | 0.129 | 0.109 | 0.093 |
| -2.208000000000219 | 0.129 | 0.11 | 0.094 |
| -2.204000000000219 | 0.13 | 0.11 | 0.094 |
| -2.200000000000219 | 0.13 | 0.111 | 0.095 |
| -2.196000000000219 | 0.131 | 0.111 | 0.095 |
| -2.192000000000219 | 0.131 | 0.112 | 0.095 |
| -2.188000000000219 | 0.132 | 0.112 | 0.096 |
| -2.184000000000219 | 0.132 | 0.113 | 0.096 |
| -2.180000000000219 | 0.133 | 0.113 | 0.097 |
| -2.176000000000219 | 0.133 | 0.113 | 0.097 |
| -2.172000000000219 | 0.134 | 0.114 | 0.097 |
| -2.168000000000219 | 0.134 | 0.114 | 0.098 |
| -2.164000000000219 | 0.135 | 0.115 | 0.098 |
| -2.160000000000219 | 0.135 | 0.115 | 0.099 |
| -2.156000000000219 | 0.136 | 0.116 | 0.099 |
| -2.152000000000219 | 0.136 | 0.116 | 0.099 |
| -2.148000000000219 | 0.137 | 0.117 | 0.1 |
| -2.144000000000219 | 0.137 | 0.117 | 0.1 |
| -2.140000000000219 | 0.138 | 0.118 | 0.101 |
| -2.136000000000219 | 0.138 | 0.118 | 0.101 |
| -2.132000000000219 | 0.139 | 0.119 | 0.102 |
| -2.128000000000219 | 0.139 | 0.119 | 0.102 |
| -2.124000000000219 | 0.14 | 0.12 | 0.102 |
| -2.120000000000219 | 0.14 | 0.12 | 0.103 |
| -2.116000000000219 | 0.141 | 0.121 | 0.103 |
| -2.112000000000219 | 0.142 | 0.121 | 0.104 |
| -2.108000000000219 | 0.142 | 0.121 | 0.104 |
| -2.104000000000219 | 0.143 | 0.122 | 0.105 |
| -2.100000000000219 | 0.143 | 0.122 | 0.105 |
| -2.096000000000219 | 0.144 | 0.123 | 0.105 |
| -2.092000000000219 | 0.144 | 0.123 | 0.106 |
| -2.088000000000219 | 0.145 | 0.124 | 0.106 |
| -2.084000000000219 | 0.145 | 0.124 | 0.107 |
| -2.080000000000219 | 0.146 | 0.125 | 0.107 |
| -2.076000000000219 | 0.146 | 0.125 | 0.108 |
| -2.072000000000219 | 0.147 | 0.126 | 0.108 |
| -2.068000000000219 | 0.148 | 0.126 | 0.109 |
| -2.064000000000219 | 0.148 | 0.127 | 0.109 |
| -2.060000000000219 | 0.149 | 0.127 | 0.11 |
| -2.056000000000219 | 0.149 | 0.128 | 0.11 |
| -2.052000000000219 | 0.15 | 0.128 | 0.11 |
| -2.048000000000219 | 0.15 | 0.129 | 0.111 |
| -2.044000000000219 | 0.151 | 0.13 | 0.111 |
| -2.040000000000219 | 0.152 | 0.13 | 0.112 |
| -2.036000000000219 | 0.152 | 0.131 | 0.112 |
| -2.032000000000219 | 0.153 | 0.131 | 0.113 |
| -2.028000000000219 | 0.153 | 0.132 | 0.113 |
| -2.024000000000219 | 0.154 | 0.132 | 0.114 |
| -2.020000000000219 | 0.154 | 0.133 | 0.114 |
| -2.016000000000219 | 0.155 | 0.133 | 0.115 |
| -2.012000000000219 | 0.156 | 0.134 | 0.115 |
| -2.008000000000218 | 0.156 | 0.134 | 0.116 |
| -2.004000000000218 | 0.157 | 0.135 | 0.116 |
| -2.000000000000218 | 0.157 | 0.135 | 0.117 |
| -1.996000000000218 | 0.158 | 0.136 | 0.117 |
| -1.992000000000218 | 0.159 | 0.136 | 0.118 |
| -1.988000000000218 | 0.159 | 0.137 | 0.118 |
| -1.984000000000218 | 0.16 | 0.138 | 0.119 |
| -1.980000000000218 | 0.16 | 0.138 | 0.119 |
| -1.976000000000218 | 0.161 | 0.139 | 0.12 |
| -1.972000000000218 | 0.162 | 0.139 | 0.12 |
| -1.968000000000218 | 0.162 | 0.14 | 0.121 |
| -1.964000000000218 | 0.163 | 0.14 | 0.121 |
| -1.960000000000218 | 0.164 | 0.141 | 0.122 |
| -1.956000000000218 | 0.164 | 0.141 | 0.122 |
| -1.952000000000218 | 0.165 | 0.142 | 0.123 |
| -1.948000000000218 | 0.165 | 0.143 | 0.123 |
| -1.944000000000218 | 0.166 | 0.143 | 0.124 |
| -1.940000000000218 | 0.167 | 0.144 | 0.124 |
| -1.936000000000218 | 0.167 | 0.144 | 0.125 |
| -1.932000000000218 | 0.168 | 0.145 | 0.125 |
| -1.928000000000218 | 0.169 | 0.145 | 0.126 |
| -1.924000000000218 | 0.169 | 0.146 | 0.126 |
| -1.920000000000218 | 0.17 | 0.147 | 0.127 |
| -1.916000000000218 | 0.171 | 0.147 | 0.127 |
| -1.912000000000218 | 0.171 | 0.148 | 0.128 |
| -1.908000000000218 | 0.172 | 0.148 | 0.128 |
| -1.904000000000218 | 0.172 | 0.149 | 0.129 |
| -1.900000000000218 | 0.173 | 0.15 | 0.13 |
| -1.896000000000218 | 0.174 | 0.15 | 0.13 |
| -1.892000000000218 | 0.174 | 0.151 | 0.131 |
| -1.888000000000218 | 0.175 | 0.151 | 0.131 |
| -1.884000000000218 | 0.176 | 0.152 | 0.132 |
| -1.880000000000218 | 0.176 | 0.153 | 0.132 |
| -1.876000000000218 | 0.177 | 0.153 | 0.133 |
| -1.872000000000218 | 0.178 | 0.154 | 0.133 |
| -1.868000000000218 | 0.178 | 0.154 | 0.134 |
| -1.864000000000218 | 0.179 | 0.155 | 0.135 |
| -1.860000000000218 | 0.18 | 0.156 | 0.135 |
| -1.856000000000218 | 0.181 | 0.156 | 0.136 |
| -1.852000000000218 | 0.181 | 0.157 | 0.136 |
| -1.848000000000218 | 0.182 | 0.158 | 0.137 |
| -1.844000000000218 | 0.183 | 0.158 | 0.137 |
| -1.840000000000218 | 0.183 | 0.159 | 0.138 |
| -1.836000000000218 | 0.184 | 0.159 | 0.139 |
| -1.832000000000218 | 0.185 | 0.16 | 0.139 |
| -1.828000000000218 | 0.185 | 0.161 | 0.14 |
| -1.824000000000218 | 0.186 | 0.161 | 0.14 |
| -1.820000000000218 | 0.187 | 0.162 | 0.141 |
| -1.816000000000218 | 0.188 | 0.163 | 0.141 |
| -1.812000000000218 | 0.188 | 0.163 | 0.142 |
| -1.808000000000218 | 0.189 | 0.164 | 0.143 |
| -1.804000000000218 | 0.19 | 0.165 | 0.143 |
| -1.800000000000218 | 0.19 | 0.165 | 0.144 |
| -1.796000000000218 | 0.191 | 0.166 | 0.144 |
| -1.792000000000218 | 0.192 | 0.167 | 0.145 |
| -1.788000000000218 | 0.193 | 0.167 | 0.146 |
| -1.784000000000218 | 0.193 | 0.168 | 0.146 |
| -1.780000000000218 | 0.194 | 0.169 | 0.147 |
| -1.776000000000218 | 0.195 | 0.169 | 0.148 |
| -1.772000000000218 | 0.196 | 0.17 | 0.148 |
| -1.768000000000218 | 0.196 | 0.171 | 0.149 |
| -1.764000000000218 | 0.197 | 0.171 | 0.149 |
| -1.760000000000218 | 0.198 | 0.172 | 0.15 |
| -1.756000000000218 | 0.199 | 0.173 | 0.151 |
| -1.752000000000218 | 0.199 | 0.173 | 0.151 |
| -1.748000000000218 | 0.2 | 0.174 | 0.152 |
| -1.744000000000218 | 0.201 | 0.175 | 0.153 |
| -1.740000000000218 | 0.202 | 0.176 | 0.153 |
| -1.736000000000218 | 0.202 | 0.176 | 0.154 |
| -1.732000000000218 | 0.203 | 0.177 | 0.155 |
| -1.728000000000218 | 0.204 | 0.178 | 0.155 |
| -1.724000000000218 | 0.205 | 0.178 | 0.156 |
| -1.720000000000218 | 0.205 | 0.179 | 0.156 |
| -1.716000000000218 | 0.206 | 0.18 | 0.157 |
| -1.712000000000218 | 0.207 | 0.181 | 0.158 |
| -1.708000000000218 | 0.208 | 0.181 | 0.158 |
| -1.704000000000218 | 0.209 | 0.182 | 0.159 |
| -1.700000000000218 | 0.209 | 0.183 | 0.16 |
| -1.696000000000218 | 0.21 | 0.183 | 0.16 |
| -1.692000000000218 | 0.211 | 0.184 | 0.161 |
| -1.688000000000218 | 0.212 | 0.185 | 0.162 |
| -1.684000000000218 | 0.213 | 0.186 | 0.163 |
| -1.680000000000218 | 0.213 | 0.186 | 0.163 |
| -1.676000000000218 | 0.214 | 0.187 | 0.164 |
| -1.672000000000218 | 0.215 | 0.188 | 0.165 |
| -1.668000000000218 | 0.216 | 0.189 | 0.165 |
| -1.664000000000218 | 0.217 | 0.189 | 0.166 |
| -1.660000000000218 | 0.217 | 0.19 | 0.167 |
| -1.656000000000218 | 0.218 | 0.191 | 0.167 |
| -1.652000000000218 | 0.219 | 0.192 | 0.168 |
| -1.648000000000218 | 0.22 | 0.192 | 0.169 |
| -1.644000000000218 | 0.221 | 0.193 | 0.169 |
| -1.640000000000218 | 0.222 | 0.194 | 0.17 |
| -1.636000000000218 | 0.222 | 0.195 | 0.171 |
| -1.632000000000218 | 0.223 | 0.196 | 0.172 |
| -1.628000000000218 | 0.224 | 0.196 | 0.172 |
| -1.624000000000218 | 0.225 | 0.197 | 0.173 |
| -1.620000000000218 | 0.226 | 0.198 | 0.174 |
| -1.616000000000218 | 0.227 | 0.199 | 0.175 |
| -1.612000000000218 | 0.228 | 0.199 | 0.175 |
| -1.608000000000218 | 0.228 | 0.2 | 0.176 |
| -1.604000000000218 | 0.229 | 0.201 | 0.177 |
| -1.600000000000218 | 0.23 | 0.202 | 0.177 |
| -1.596000000000218 | 0.231 | 0.203 | 0.178 |
| -1.592000000000218 | 0.232 | 0.204 | 0.179 |
| -1.588000000000218 | 0.233 | 0.204 | 0.18 |
| -1.584000000000218 | 0.234 | 0.205 | 0.181 |
| -1.580000000000218 | 0.235 | 0.206 | 0.181 |
| -1.576000000000218 | 0.236 | 0.207 | 0.182 |
| -1.572000000000218 | 0.236 | 0.208 | 0.183 |
| -1.568000000000218 | 0.237 | 0.208 | 0.184 |
| -1.564000000000218 | 0.238 | 0.209 | 0.184 |
| -1.560000000000218 | 0.239 | 0.21 | 0.185 |
| -1.556000000000218 | 0.24 | 0.211 | 0.186 |
| -1.552000000000218 | 0.241 | 0.212 | 0.187 |
| -1.548000000000218 | 0.242 | 0.213 | 0.187 |
| -1.544000000000218 | 0.243 | 0.214 | 0.188 |
| -1.540000000000218 | 0.244 | 0.214 | 0.189 |
| -1.536000000000218 | 0.245 | 0.215 | 0.19 |
| -1.532000000000218 | 0.246 | 0.216 | 0.191 |
| -1.528000000000218 | 0.247 | 0.217 | 0.191 |
| -1.524000000000218 | 0.247 | 0.218 | 0.192 |
| -1.520000000000218 | 0.248 | 0.219 | 0.193 |
| -1.516000000000218 | 0.249 | 0.22 | 0.194 |
| -1.512000000000218 | 0.25 | 0.22 | 0.195 |
| -1.508000000000218 | 0.251 | 0.221 | 0.196 |
| -1.504000000000218 | 0.252 | 0.222 | 0.196 |
| -1.500000000000218 | 0.253 | 0.223 | 0.197 |
| -1.496000000000218 | 0.254 | 0.224 | 0.198 |
| -1.492000000000218 | 0.255 | 0.225 | 0.199 |
| -1.488000000000218 | 0.256 | 0.226 | 0.2 |
| -1.484000000000218 | 0.257 | 0.227 | 0.2 |
| -1.480000000000218 | 0.258 | 0.228 | 0.201 |
| -1.476000000000218 | 0.259 | 0.229 | 0.202 |
| -1.472000000000218 | 0.26 | 0.229 | 0.203 |
| -1.468000000000218 | 0.261 | 0.23 | 0.204 |
| -1.464000000000218 | 0.262 | 0.231 | 0.205 |
| -1.460000000000218 | 0.263 | 0.232 | 0.206 |
| -1.456000000000218 | 0.264 | 0.233 | 0.206 |
| -1.452000000000218 | 0.265 | 0.234 | 0.207 |
| -1.448000000000218 | 0.266 | 0.235 | 0.208 |
| -1.444000000000218 | 0.267 | 0.236 | 0.209 |
| -1.440000000000218 | 0.268 | 0.237 | 0.21 |
| -1.436000000000218 | 0.269 | 0.238 | 0.211 |
| -1.432000000000218 | 0.27 | 0.239 | 0.212 |
| -1.428000000000218 | 0.271 | 0.24 | 0.213 |
| -1.424000000000218 | 0.272 | 0.241 | 0.214 |
| -1.420000000000218 | 0.273 | 0.242 | 0.214 |
| -1.416000000000218 | 0.274 | 0.243 | 0.215 |
| -1.412000000000218 | 0.275 | 0.244 | 0.216 |
| -1.408000000000218 | 0.276 | 0.245 | 0.217 |
| -1.404000000000218 | 0.277 | 0.246 | 0.218 |
| -1.400000000000218 | 0.278 | 0.247 | 0.219 |
| -1.396000000000218 | 0.279 | 0.248 | 0.22 |
| -1.392000000000218 | 0.281 | 0.249 | 0.221 |
| -1.388000000000218 | 0.282 | 0.25 | 0.222 |
| -1.384000000000218 | 0.283 | 0.251 | 0.223 |
| -1.380000000000218 | 0.284 | 0.252 | 0.224 |
| -1.376000000000218 | 0.285 | 0.253 | 0.225 |
| -1.372000000000218 | 0.286 | 0.254 | 0.226 |
| -1.368000000000218 | 0.287 | 0.255 | 0.226 |
| -1.364000000000218 | 0.288 | 0.256 | 0.227 |
| -1.360000000000218 | 0.289 | 0.257 | 0.228 |
| -1.356000000000218 | 0.29 | 0.258 | 0.229 |
| -1.352000000000218 | 0.291 | 0.259 | 0.23 |
| -1.348000000000218 | 0.292 | 0.26 | 0.231 |
| -1.344000000000218 | 0.294 | 0.261 | 0.232 |
| -1.340000000000218 | 0.295 | 0.262 | 0.233 |
| -1.336000000000218 | 0.296 | 0.263 | 0.234 |
| -1.332000000000218 | 0.297 | 0.264 | 0.235 |
| -1.328000000000218 | 0.298 | 0.265 | 0.236 |
| -1.324000000000218 | 0.299 | 0.266 | 0.237 |
| -1.320000000000218 | 0.3 | 0.267 | 0.238 |
| -1.316000000000218 | 0.302 | 0.268 | 0.239 |
| -1.312000000000218 | 0.303 | 0.269 | 0.24 |
| -1.308000000000218 | 0.304 | 0.27 | 0.241 |
| -1.304000000000218 | 0.305 | 0.271 | 0.242 |
| -1.300000000000218 | 0.306 | 0.273 | 0.243 |
| -1.296000000000218 | 0.307 | 0.274 | 0.244 |
| -1.292000000000218 | 0.308 | 0.275 | 0.245 |
| -1.288000000000218 | 0.31 | 0.276 | 0.246 |
| -1.284000000000218 | 0.311 | 0.277 | 0.247 |
| -1.280000000000218 | 0.312 | 0.278 | 0.248 |
| -1.276000000000218 | 0.313 | 0.279 | 0.249 |
| -1.272000000000218 | 0.314 | 0.28 | 0.25 |
| -1.268000000000218 | 0.316 | 0.281 | 0.252 |
| -1.264000000000218 | 0.317 | 0.283 | 0.253 |
| -1.260000000000218 | 0.318 | 0.284 | 0.254 |
| -1.256000000000218 | 0.319 | 0.285 | 0.255 |
| -1.252000000000218 | 0.32 | 0.286 | 0.256 |
| -1.248000000000218 | 0.322 | 0.287 | 0.257 |
| -1.244000000000218 | 0.323 | 0.288 | 0.258 |
| -1.240000000000218 | 0.324 | 0.289 | 0.259 |
| -1.236000000000218 | 0.325 | 0.291 | 0.26 |
| -1.232000000000218 | 0.327 | 0.292 | 0.261 |
| -1.228000000000218 | 0.328 | 0.293 | 0.262 |
| -1.224000000000218 | 0.329 | 0.294 | 0.263 |
| -1.220000000000218 | 0.33 | 0.295 | 0.265 |
| -1.216000000000218 | 0.332 | 0.296 | 0.266 |
| -1.212000000000218 | 0.333 | 0.298 | 0.267 |
| -1.208000000000218 | 0.334 | 0.299 | 0.268 |
| -1.204000000000218 | 0.335 | 0.3 | 0.269 |
| -1.200000000000218 | 0.337 | 0.301 | 0.27 |
| -1.196000000000218 | 0.338 | 0.302 | 0.271 |
| -1.192000000000218 | 0.339 | 0.304 | 0.272 |
| -1.188000000000218 | 0.341 | 0.305 | 0.274 |
| -1.184000000000218 | 0.342 | 0.306 | 0.275 |
| -1.180000000000218 | 0.343 | 0.307 | 0.276 |
| -1.176000000000218 | 0.344 | 0.309 | 0.277 |
| -1.172000000000218 | 0.346 | 0.31 | 0.278 |
| -1.168000000000218 | 0.347 | 0.311 | 0.279 |
| -1.164000000000218 | 0.348 | 0.312 | 0.281 |
| -1.160000000000218 | 0.35 | 0.313 | 0.282 |
| -1.156000000000218 | 0.351 | 0.315 | 0.283 |
| -1.152000000000218 | 0.352 | 0.316 | 0.284 |
| -1.148000000000218 | 0.354 | 0.317 | 0.285 |
| -1.144000000000218 | 0.355 | 0.319 | 0.287 |
| -1.140000000000218 | 0.356 | 0.32 | 0.288 |
| -1.136000000000218 | 0.358 | 0.321 | 0.289 |
| -1.132000000000218 | 0.359 | 0.322 | 0.29 |
| -1.128000000000218 | 0.36 | 0.324 | 0.291 |
| -1.124000000000218 | 0.362 | 0.325 | 0.293 |
| -1.120000000000218 | 0.363 | 0.326 | 0.294 |
| -1.116000000000218 | 0.365 | 0.328 | 0.295 |
| -1.112000000000218 | 0.366 | 0.329 | 0.296 |
| -1.108000000000218 | 0.367 | 0.33 | 0.298 |
| -1.104000000000218 | 0.369 | 0.332 | 0.299 |
| -1.100000000000218 | 0.37 | 0.333 | 0.3 |
| -1.096000000000218 | 0.372 | 0.334 | 0.301 |
| -1.092000000000218 | 0.373 | 0.336 | 0.303 |
| -1.088000000000218 | 0.374 | 0.337 | 0.304 |
| -1.084000000000218 | 0.376 | 0.338 | 0.305 |
| -1.080000000000218 | 0.377 | 0.34 | 0.306 |
| -1.076000000000218 | 0.379 | 0.341 | 0.308 |
| -1.072000000000218 | 0.38 | 0.342 | 0.309 |
| -1.068000000000218 | 0.382 | 0.344 | 0.31 |
| -1.064000000000218 | 0.383 | 0.345 | 0.312 |
| -1.060000000000218 | 0.385 | 0.346 | 0.313 |
| -1.056000000000218 | 0.386 | 0.348 | 0.314 |
| -1.052000000000218 | 0.387 | 0.349 | 0.316 |
| -1.048000000000218 | 0.389 | 0.351 | 0.317 |
| -1.044000000000218 | 0.39 | 0.352 | 0.318 |
| -1.040000000000218 | 0.392 | 0.353 | 0.32 |
| -1.036000000000218 | 0.393 | 0.355 | 0.321 |
| -1.032000000000218 | 0.395 | 0.356 | 0.322 |
| -1.028000000000218 | 0.396 | 0.358 | 0.324 |
| -1.024000000000218 | 0.398 | 0.359 | 0.325 |
| -1.020000000000218 | 0.399 | 0.361 | 0.326 |
| -1.016000000000218 | 0.401 | 0.362 | 0.328 |
| -1.012000000000218 | 0.402 | 0.363 | 0.329 |
| -1.008000000000218 | 0.404 | 0.365 | 0.33 |
| -1.004000000000218 | 0.406 | 0.366 | 0.332 |
| -1.000000000000218 | 0.407 | 0.368 | 0.333 |
| -0.996000000000218 | 0.409 | 0.369 | 0.335 |
| -0.992000000000218 | 0.41 | 0.371 | 0.336 |
| -0.988000000000218 | 0.412 | 0.372 | 0.337 |
| -0.984000000000218 | 0.413 | 0.374 | 0.339 |
| -0.980000000000218 | 0.415 | 0.375 | 0.34 |
| -0.976000000000218 | 0.416 | 0.377 | 0.342 |
| -0.972000000000218 | 0.418 | 0.378 | 0.343 |
| -0.968000000000218 | 0.42 | 0.38 | 0.345 |
| -0.964000000000218 | 0.421 | 0.381 | 0.346 |
| -0.960000000000218 | 0.423 | 0.383 | 0.348 |
| -0.956000000000218 | 0.424 | 0.384 | 0.349 |
| -0.952000000000218 | 0.426 | 0.386 | 0.351 |
| -0.948000000000218 | 0.428 | 0.388 | 0.352 |
| -0.944000000000218 | 0.429 | 0.389 | 0.353 |
| -0.940000000000218 | 0.431 | 0.391 | 0.355 |
| -0.936000000000218 | 0.433 | 0.392 | 0.356 |
| -0.932000000000218 | 0.434 | 0.394 | 0.358 |
| -0.928000000000218 | 0.436 | 0.395 | 0.359 |
| -0.924000000000218 | 0.438 | 0.397 | 0.361 |
| -0.920000000000218 | 0.439 | 0.399 | 0.362 |
| -0.916000000000218 | 0.441 | 0.4 | 0.364 |
| -0.912000000000218 | 0.443 | 0.402 | 0.366 |
| -0.908000000000217 | 0.444 | 0.403 | 0.367 |
| -0.904000000000217 | 0.446 | 0.405 | 0.369 |
| -0.900000000000217 | 0.448 | 0.407 | 0.37 |
| -0.896000000000217 | 0.449 | 0.408 | 0.372 |
| -0.892000000000217 | 0.451 | 0.41 | 0.373 |
| -0.888000000000217 | 0.453 | 0.411 | 0.375 |
| -0.884000000000217 | 0.455 | 0.413 | 0.376 |
| -0.880000000000217 | 0.456 | 0.415 | 0.378 |
| -0.876000000000217 | 0.458 | 0.416 | 0.38 |
| -0.872000000000217 | 0.46 | 0.418 | 0.381 |
| -0.868000000000217 | 0.461 | 0.42 | 0.383 |
| -0.864000000000217 | 0.463 | 0.421 | 0.384 |
| -0.860000000000217 | 0.465 | 0.423 | 0.386 |
| -0.856000000000217 | 0.467 | 0.425 | 0.388 |
| -0.852000000000217 | 0.469 | 0.427 | 0.389 |
| -0.848000000000217 | 0.47 | 0.428 | 0.391 |
| -0.844000000000217 | 0.472 | 0.43 | 0.393 |
| -0.840000000000217 | 0.474 | 0.432 | 0.394 |
| -0.836000000000217 | 0.476 | 0.433 | 0.396 |
| -0.832000000000217 | 0.478 | 0.435 | 0.398 |
| -0.828000000000217 | 0.479 | 0.437 | 0.399 |
| -0.824000000000217 | 0.481 | 0.439 | 0.401 |
| -0.820000000000217 | 0.483 | 0.44 | 0.403 |
| -0.816000000000217 | 0.485 | 0.442 | 0.404 |
| -0.812000000000217 | 0.487 | 0.444 | 0.406 |
| -0.808000000000217 | 0.489 | 0.446 | 0.408 |
| -0.804000000000217 | 0.49 | 0.448 | 0.409 |
| -0.800000000000217 | 0.492 | 0.449 | 0.411 |
| -0.796000000000217 | 0.494 | 0.451 | 0.413 |
| -0.792000000000217 | 0.496 | 0.453 | 0.415 |
| -0.788000000000217 | 0.498 | 0.455 | 0.416 |
| -0.784000000000217 | 0.5 | 0.457 | 0.418 |
| -0.780000000000217 | 0.502 | 0.458 | 0.42 |
| -0.776000000000217 | 0.504 | 0.46 | 0.422 |
| -0.772000000000217 | 0.506 | 0.462 | 0.423 |
| -0.768000000000217 | 0.507 | 0.464 | 0.425 |
| -0.764000000000217 | 0.509 | 0.466 | 0.427 |
| -0.760000000000217 | 0.511 | 0.468 | 0.429 |
| -0.756000000000217 | 0.513 | 0.47 | 0.431 |
| -0.752000000000217 | 0.515 | 0.471 | 0.432 |
| -0.748000000000217 | 0.517 | 0.473 | 0.434 |
| -0.744000000000217 | 0.519 | 0.475 | 0.436 |
| -0.740000000000217 | 0.521 | 0.477 | 0.438 |
| -0.736000000000217 | 0.523 | 0.479 | 0.44 |
| -0.732000000000217 | 0.525 | 0.481 | 0.442 |
| -0.728000000000217 | 0.527 | 0.483 | 0.443 |
| -0.724000000000217 | 0.529 | 0.485 | 0.445 |
| -0.720000000000217 | 0.531 | 0.487 | 0.447 |
| -0.716000000000217 | 0.533 | 0.489 | 0.449 |
| -0.712000000000217 | 0.535 | 0.491 | 0.451 |
| -0.708000000000217 | 0.537 | 0.493 | 0.453 |
| -0.704000000000217 | 0.539 | 0.495 | 0.455 |
| -0.700000000000217 | 0.541 | 0.497 | 0.457 |
| -0.696000000000217 | 0.543 | 0.499 | 0.459 |
| -0.692000000000217 | 0.545 | 0.501 | 0.461 |
| -0.688000000000217 | 0.548 | 0.503 | 0.462 |
| -0.684000000000217 | 0.55 | 0.505 | 0.464 |
| -0.680000000000217 | 0.552 | 0.507 | 0.466 |
| -0.676000000000217 | 0.554 | 0.509 | 0.468 |
| -0.672000000000217 | 0.556 | 0.511 | 0.47 |
| -0.668000000000217 | 0.558 | 0.513 | 0.472 |
| -0.664000000000217 | 0.56 | 0.515 | 0.474 |
| -0.660000000000217 | 0.562 | 0.517 | 0.476 |
| -0.656000000000217 | 0.564 | 0.519 | 0.478 |
| -0.652000000000217 | 0.567 | 0.521 | 0.48 |
| -0.648000000000217 | 0.569 | 0.523 | 0.482 |
| -0.644000000000217 | 0.571 | 0.525 | 0.484 |
| -0.640000000000217 | 0.573 | 0.527 | 0.486 |
| -0.636000000000217 | 0.575 | 0.529 | 0.488 |
| -0.632000000000217 | 0.577 | 0.532 | 0.49 |
| -0.628000000000217 | 0.58 | 0.534 | 0.493 |
| -0.624000000000217 | 0.582 | 0.536 | 0.495 |
| -0.620000000000217 | 0.584 | 0.538 | 0.497 |
| -0.616000000000217 | 0.586 | 0.54 | 0.499 |
| -0.612000000000217 | 0.589 | 0.542 | 0.501 |
| -0.608000000000217 | 0.591 | 0.544 | 0.503 |
| -0.604000000000217 | 0.593 | 0.547 | 0.505 |
| -0.600000000000217 | 0.595 | 0.549 | 0.507 |
| -0.596000000000217 | 0.598 | 0.551 | 0.509 |
| -0.592000000000217 | 0.6 | 0.553 | 0.512 |
| -0.588000000000217 | 0.602 | 0.555 | 0.514 |
| -0.584000000000217 | 0.604 | 0.558 | 0.516 |
| -0.580000000000217 | 0.607 | 0.56 | 0.518 |
| -0.576000000000217 | 0.609 | 0.562 | 0.52 |
| -0.572000000000217 | 0.611 | 0.564 | 0.522 |
| -0.568000000000217 | 0.614 | 0.567 | 0.525 |
| -0.564000000000217 | 0.616 | 0.569 | 0.527 |
| -0.560000000000217 | 0.618 | 0.571 | 0.529 |
| -0.556000000000217 | 0.621 | 0.573 | 0.531 |
| -0.552000000000217 | 0.623 | 0.576 | 0.533 |
| -0.548000000000217 | 0.625 | 0.578 | 0.536 |
| -0.544000000000217 | 0.628 | 0.58 | 0.538 |
| -0.540000000000217 | 0.63 | 0.583 | 0.54 |
| -0.536000000000217 | 0.633 | 0.585 | 0.542 |
| -0.532000000000217 | 0.635 | 0.587 | 0.545 |
| -0.528000000000217 | 0.637 | 0.59 | 0.547 |
| -0.524000000000217 | 0.64 | 0.592 | 0.549 |
| -0.520000000000217 | 0.642 | 0.595 | 0.552 |
| -0.516000000000217 | 0.645 | 0.597 | 0.554 |
| -0.512000000000217 | 0.647 | 0.599 | 0.556 |
| -0.508000000000217 | 0.65 | 0.602 | 0.559 |
| -0.504000000000217 | 0.652 | 0.604 | 0.561 |
| -0.500000000000217 | 0.655 | 0.607 | 0.563 |
| -0.496000000000217 | 0.657 | 0.609 | 0.566 |
| -0.492000000000217 | 0.66 | 0.611 | 0.568 |
| -0.488000000000217 | 0.662 | 0.614 | 0.571 |
| -0.484000000000217 | 0.665 | 0.616 | 0.573 |
| -0.480000000000217 | 0.667 | 0.619 | 0.575 |
| -0.476000000000217 | 0.67 | 0.621 | 0.578 |
| -0.472000000000217 | 0.672 | 0.624 | 0.58 |
| -0.468000000000217 | 0.675 | 0.626 | 0.583 |
| -0.464000000000217 | 0.677 | 0.629 | 0.585 |
| -0.460000000000217 | 0.68 | 0.631 | 0.588 |
| -0.456000000000217 | 0.683 | 0.634 | 0.59 |
| -0.452000000000217 | 0.685 | 0.636 | 0.593 |
| -0.448000000000217 | 0.688 | 0.639 | 0.595 |
| -0.444000000000217 | 0.69 | 0.641 | 0.598 |
| -0.440000000000217 | 0.693 | 0.644 | 0.6 |
| -0.436000000000217 | 0.696 | 0.647 | 0.603 |
| -0.432000000000217 | 0.698 | 0.649 | 0.605 |
| -0.428000000000217 | 0.701 | 0.652 | 0.608 |
| -0.424000000000217 | 0.704 | 0.654 | 0.61 |
| -0.420000000000217 | 0.706 | 0.657 | 0.613 |
| -0.416000000000217 | 0.709 | 0.66 | 0.615 |
| -0.412000000000217 | 0.712 | 0.662 | 0.618 |
| -0.408000000000217 | 0.714 | 0.665 | 0.621 |
| -0.404000000000217 | 0.717 | 0.668 | 0.623 |
| -0.400000000000217 | 0.72 | 0.67 | 0.626 |
| -0.396000000000217 | 0.723 | 0.673 | 0.628 |
| -0.392000000000217 | 0.725 | 0.676 | 0.631 |
| -0.388000000000217 | 0.728 | 0.678 | 0.634 |
| -0.384000000000217 | 0.731 | 0.681 | 0.636 |
| -0.380000000000217 | 0.734 | 0.684 | 0.639 |
| -0.376000000000217 | 0.736 | 0.687 | 0.642 |
| -0.372000000000217 | 0.739 | 0.689 | 0.644 |
| -0.368000000000217 | 0.742 | 0.692 | 0.647 |
| -0.364000000000217 | 0.745 | 0.695 | 0.65 |
| -0.360000000000217 | 0.748 | 0.698 | 0.653 |
| -0.356000000000217 | 0.751 | 0.7 | 0.655 |
| -0.352000000000217 | 0.753 | 0.703 | 0.658 |
| -0.348000000000217 | 0.756 | 0.706 | 0.661 |
| -0.344000000000217 | 0.759 | 0.709 | 0.664 |
| -0.340000000000217 | 0.762 | 0.712 | 0.666 |
| -0.336000000000217 | 0.765 | 0.715 | 0.669 |
| -0.332000000000217 | 0.768 | 0.717 | 0.672 |
| -0.328000000000217 | 0.771 | 0.72 | 0.675 |
| -0.324000000000217 | 0.774 | 0.723 | 0.678 |
| -0.320000000000217 | 0.777 | 0.726 | 0.681 |
| -0.316000000000217 | 0.78 | 0.729 | 0.683 |
| -0.312000000000217 | 0.783 | 0.732 | 0.686 |
| -0.308000000000217 | 0.786 | 0.735 | 0.689 |
| -0.304000000000217 | 0.789 | 0.738 | 0.692 |
| -0.300000000000217 | 0.792 | 0.741 | 0.695 |
| -0.296000000000217 | 0.795 | 0.744 | 0.698 |
| -0.292000000000217 | 0.798 | 0.747 | 0.701 |
| -0.288000000000217 | 0.801 | 0.75 | 0.704 |
| -0.284000000000217 | 0.804 | 0.753 | 0.707 |
| -0.280000000000217 | 0.807 | 0.756 | 0.71 |
| -0.276000000000217 | 0.81 | 0.759 | 0.713 |
| -0.272000000000217 | 0.813 | 0.762 | 0.716 |
| -0.268000000000217 | 0.816 | 0.765 | 0.719 |
| -0.264000000000217 | 0.819 | 0.768 | 0.722 |
| -0.260000000000217 | 0.822 | 0.771 | 0.725 |
| -0.256000000000217 | 0.825 | 0.774 | 0.728 |
| -0.252000000000217 | 0.829 | 0.777 | 0.731 |
| -0.248000000000217 | 0.832 | 0.78 | 0.734 |
| -0.244000000000217 | 0.835 | 0.783 | 0.737 |
| -0.240000000000217 | 0.838 | 0.787 | 0.74 |
| -0.236000000000217 | 0.841 | 0.79 | 0.743 |
| -0.232000000000217 | 0.844 | 0.793 | 0.746 |
| -0.228000000000217 | 0.848 | 0.796 | 0.75 |
| -0.224000000000217 | 0.851 | 0.799 | 0.753 |
| -0.220000000000217 | 0.854 | 0.803 | 0.756 |
| -0.216000000000217 | 0.857 | 0.806 | 0.759 |
| -0.212000000000217 | 0.861 | 0.809 | 0.762 |
| -0.208000000000217 | 0.864 | 0.812 | 0.766 |
| -0.204000000000217 | 0.867 | 0.815 | 0.769 |
| -0.200000000000217 | 0.87 | 0.819 | 0.772 |
| -0.196000000000217 | 0.874 | 0.822 | 0.775 |
| -0.192000000000217 | 0.877 | 0.825 | 0.778 |
| -0.188000000000217 | 0.88 | 0.829 | 0.782 |
| -0.184000000000217 | 0.884 | 0.832 | 0.785 |
| -0.180000000000217 | 0.887 | 0.835 | 0.788 |
| -0.176000000000217 | 0.891 | 0.839 | 0.792 |
| -0.172000000000217 | 0.894 | 0.842 | 0.795 |
| -0.168000000000217 | 0.897 | 0.845 | 0.798 |
| -0.164000000000217 | 0.901 | 0.849 | 0.802 |
| -0.160000000000217 | 0.904 | 0.852 | 0.805 |
| -0.156000000000217 | 0.908 | 0.856 | 0.808 |
| -0.152000000000217 | 0.911 | 0.859 | 0.812 |
| -0.148000000000217 | 0.915 | 0.862 | 0.815 |
| -0.144000000000217 | 0.918 | 0.866 | 0.819 |
| -0.140000000000217 | 0.922 | 0.869 | 0.822 |
| -0.136000000000217 | 0.925 | 0.873 | 0.826 |
| -0.132000000000217 | 0.929 | 0.876 | 0.829 |
| -0.128000000000217 | 0.932 | 0.88 | 0.833 |
| -0.124000000000217 | 0.936 | 0.883 | 0.836 |
| -0.120000000000217 | 0.939 | 0.887 | 0.84 |
| -0.116000000000217 | 0.943 | 0.89 | 0.843 |
| -0.112000000000217 | 0.946 | 0.894 | 0.847 |
| -0.108000000000217 | 0.95 | 0.898 | 0.85 |
| -0.104000000000217 | 0.954 | 0.901 | 0.854 |
| -0.100000000000217 | 0.957 | 0.905 | 0.857 |
| -0.0960000000002168 | 0.961 | 0.908 | 0.861 |
| -0.0920000000002168 | 0.965 | 0.912 | 0.865 |
| -0.0880000000002168 | 0.968 | 0.916 | 0.868 |
| -0.0840000000002168 | 0.972 | 0.919 | 0.872 |
| -0.0800000000002168 | 0.976 | 0.923 | 0.876 |
| -0.0760000000002168 | 0.979 | 0.927 | 0.879 |
| -0.0720000000002168 | 0.983 | 0.931 | 0.883 |
| -0.0680000000002168 | 0.987 | 0.934 | 0.887 |
| -0.0640000000002168 | 0.991 | 0.938 | 0.89 |
| -0.0600000000002168 | 0.994 | 0.942 | 0.894 |
| -0.0560000000002168 | 0.998 | 0.946 | 0.898 |
| -0.0520000000002168 | 1.002 | 0.949 | 0.902 |
| -0.0480000000002167 | 1.006 | 0.953 | 0.906 |
| -0.0440000000002167 | 1.01 | 0.957 | 0.909 |
| -0.0400000000002167 | 1.013 | 0.961 | 0.913 |
| -0.0360000000002167 | 1.017 | 0.965 | 0.917 |
| -0.0320000000002167 | 1.021 | 0.969 | 0.921 |
| -0.0280000000002167 | 1.025 | 0.972 | 0.925 |
| -0.0240000000002167 | 1.029 | 0.976 | 0.929 |
| -0.0200000000002167 | 1.033 | 0.98 | 0.933 |
| -0.0160000000002167 | 1.037 | 0.984 | 0.937 |
| -0.0120000000002167 | 1.041 | 0.988 | 0.94 |
| -0.00800000000021674 | 1.045 | 0.992 | 0.944 |
| -0.00400000000021674 | 1.049 | 0.996 | 0.948 |
| -2.16743289982446e-13 | 1.053 | 1 | 0.952 |
| 0.00399999999978326 | 1.057 | 1.004 | 0.956 |
| 0.00799999999978325 | 1.061 | 1.008 | 0.96 |
| 0.0119999999997833 | 1.065 | 1.012 | 0.964 |
| 0.0159999999997833 | 1.069 | 1.016 | 0.969 |
| 0.0199999999997833 | 1.073 | 1.02 | 0.973 |
| 0.0239999999997833 | 1.077 | 1.024 | 0.977 |
| 0.0279999999997833 | 1.081 | 1.028 | 0.981 |
| 0.0319999999997833 | 1.085 | 1.033 | 0.985 |
| 0.0359999999997833 | 1.089 | 1.037 | 0.989 |
| 0.0399999999997833 | 1.093 | 1.041 | 0.993 |
| 0.0439999999997833 | 1.098 | 1.045 | 0.997 |
| 0.0479999999997833 | 1.102 | 1.049 | 1.002 |
| 0.0519999999997833 | 1.106 | 1.053 | 1.006 |
| 0.0559999999997833 | 1.11 | 1.058 | 1.01 |
| 0.0599999999997833 | 1.114 | 1.062 | 1.014 |
| 0.0639999999997833 | 1.119 | 1.066 | 1.019 |
| 0.0679999999997833 | 1.123 | 1.07 | 1.023 |
| 0.0719999999997833 | 1.127 | 1.075 | 1.027 |
| 0.0759999999997833 | 1.131 | 1.079 | 1.031 |
| 0.0799999999997833 | 1.136 | 1.083 | 1.036 |
| 0.0839999999997833 | 1.14 | 1.088 | 1.04 |
| 0.0879999999997833 | 1.144 | 1.092 | 1.045 |
| 0.0919999999997833 | 1.149 | 1.096 | 1.049 |
| 0.0959999999997833 | 1.153 | 1.101 | 1.053 |
| 0.0999999999997833 | 1.158 | 1.105 | 1.058 |
| 0.103999999999783 | 1.162 | 1.11 | 1.062 |
| 0.107999999999783 | 1.166 | 1.114 | 1.067 |
| 0.111999999999783 | 1.171 | 1.119 | 1.071 |
| 0.115999999999783 | 1.175 | 1.123 | 1.076 |
| 0.119999999999783 | 1.18 | 1.127 | 1.08 |
| 0.123999999999783 | 1.184 | 1.132 | 1.085 |
| 0.127999999999783 | 1.189 | 1.137 | 1.089 |
| 0.131999999999783 | 1.193 | 1.141 | 1.094 |
| 0.135999999999783 | 1.198 | 1.146 | 1.099 |
| 0.139999999999783 | 1.202 | 1.15 | 1.103 |
| 0.143999999999783 | 1.207 | 1.155 | 1.108 |
| 0.147999999999783 | 1.212 | 1.16 | 1.113 |
| 0.151999999999783 | 1.216 | 1.164 | 1.117 |
| 0.155999999999783 | 1.221 | 1.169 | 1.122 |
| 0.159999999999783 | 1.225 | 1.174 | 1.127 |
| 0.163999999999783 | 1.23 | 1.178 | 1.131 |
| 0.167999999999783 | 1.235 | 1.183 | 1.136 |
| 0.171999999999783 | 1.239 | 1.188 | 1.141 |
| 0.175999999999783 | 1.244 | 1.192 | 1.146 |
| 0.179999999999783 | 1.249 | 1.197 | 1.151 |
| 0.183999999999783 | 1.254 | 1.202 | 1.155 |
| 0.187999999999783 | 1.258 | 1.207 | 1.16 |
| 0.191999999999783 | 1.263 | 1.212 | 1.165 |
| 0.195999999999783 | 1.268 | 1.217 | 1.17 |
| 0.199999999999783 | 1.273 | 1.221 | 1.175 |
| 0.203999999999783 | 1.278 | 1.226 | 1.18 |
| 0.207999999999783 | 1.283 | 1.231 | 1.185 |
| 0.211999999999783 | 1.287 | 1.236 | 1.19 |
| 0.215999999999783 | 1.292 | 1.241 | 1.195 |
| 0.219999999999783 | 1.297 | 1.246 | 1.2 |
| 0.223999999999783 | 1.302 | 1.251 | 1.205 |
| 0.227999999999783 | 1.307 | 1.256 | 1.21 |
| 0.231999999999783 | 1.312 | 1.261 | 1.215 |
| 0.235999999999783 | 1.317 | 1.266 | 1.22 |
| 0.239999999999783 | 1.322 | 1.271 | 1.225 |
| 0.243999999999783 | 1.327 | 1.276 | 1.23 |
| 0.247999999999783 | 1.332 | 1.281 | 1.236 |
| 0.251999999999783 | 1.337 | 1.287 | 1.241 |
| 0.255999999999783 | 1.342 | 1.292 | 1.246 |
| 0.259999999999783 | 1.348 | 1.297 | 1.251 |
| 0.263999999999783 | 1.353 | 1.302 | 1.257 |
| 0.267999999999783 | 1.358 | 1.307 | 1.262 |
| 0.271999999999783 | 1.363 | 1.313 | 1.267 |
| 0.275999999999783 | 1.368 | 1.318 | 1.273 |
| 0.279999999999783 | 1.373 | 1.323 | 1.278 |
| 0.283999999999783 | 1.379 | 1.328 | 1.283 |
| 0.287999999999783 | 1.384 | 1.334 | 1.289 |
| 0.291999999999783 | 1.389 | 1.339 | 1.294 |
| 0.295999999999783 | 1.394 | 1.344 | 1.3 |
| 0.299999999999783 | 1.4 | 1.35 | 1.305 |
| 0.303999999999783 | 1.405 | 1.355 | 1.311 |
| 0.307999999999783 | 1.41 | 1.361 | 1.316 |
| 0.311999999999783 | 1.416 | 1.366 | 1.322 |
| 0.315999999999783 | 1.421 | 1.372 | 1.327 |
| 0.319999999999783 | 1.427 | 1.377 | 1.333 |
| 0.323999999999783 | 1.432 | 1.383 | 1.338 |
| 0.327999999999783 | 1.437 | 1.388 | 1.344 |
| 0.331999999999783 | 1.443 | 1.394 | 1.35 |
| 0.335999999999783 | 1.448 | 1.399 | 1.355 |
| 0.339999999999783 | 1.454 | 1.405 | 1.361 |
| 0.343999999999783 | 1.459 | 1.411 | 1.367 |
| 0.347999999999783 | 1.465 | 1.416 | 1.372 |
| 0.351999999999783 | 1.471 | 1.422 | 1.378 |
| 0.355999999999783 | 1.476 | 1.428 | 1.384 |
| 0.359999999999783 | 1.482 | 1.433 | 1.39 |
| 0.363999999999783 | 1.487 | 1.439 | 1.396 |
| 0.367999999999783 | 1.493 | 1.445 | 1.402 |
| 0.371999999999784 | 1.499 | 1.451 | 1.407 |
| 0.375999999999784 | 1.505 | 1.456 | 1.413 |
| 0.379999999999784 | 1.51 | 1.462 | 1.419 |
| 0.383999999999784 | 1.516 | 1.468 | 1.425 |
| 0.387999999999784 | 1.522 | 1.474 | 1.431 |
| 0.391999999999784 | 1.528 | 1.48 | 1.437 |
| 0.395999999999784 | 1.533 | 1.486 | 1.443 |
| 0.399999999999784 | 1.539 | 1.492 | 1.449 |
| 0.403999999999784 | 1.545 | 1.498 | 1.456 |
| 0.407999999999784 | 1.551 | 1.504 | 1.462 |
| 0.411999999999784 | 1.557 | 1.51 | 1.468 |
| 0.415999999999784 | 1.563 | 1.516 | 1.474 |
| 0.419999999999784 | 1.569 | 1.522 | 1.48 |
| 0.423999999999784 | 1.575 | 1.528 | 1.486 |
| 0.427999999999784 | 1.581 | 1.534 | 1.493 |
| 0.431999999999784 | 1.587 | 1.54 | 1.499 |
| 0.435999999999784 | 1.593 | 1.547 | 1.505 |
| 0.439999999999784 | 1.599 | 1.553 | 1.512 |
| 0.443999999999784 | 1.605 | 1.559 | 1.518 |
| 0.447999999999784 | 1.611 | 1.565 | 1.524 |
| 0.451999999999784 | 1.617 | 1.571 | 1.531 |
| 0.455999999999784 | 1.623 | 1.578 | 1.537 |
| 0.459999999999784 | 1.63 | 1.584 | 1.544 |
| 0.463999999999784 | 1.636 | 1.59 | 1.55 |
| 0.467999999999784 | 1.642 | 1.597 | 1.557 |
| 0.471999999999784 | 1.648 | 1.603 | 1.563 |
| 0.475999999999784 | 1.654 | 1.61 | 1.57 |
| 0.479999999999784 | 1.661 | 1.616 | 1.577 |
| 0.483999999999784 | 1.667 | 1.623 | 1.583 |
| 0.487999999999784 | 1.673 | 1.629 | 1.59 |
| 0.491999999999784 | 1.68 | 1.636 | 1.596 |
| 0.495999999999784 | 1.686 | 1.642 | 1.603 |
| 0.499999999999784 | 1.693 | 1.649 | 1.61 |
| 0.503999999999784 | 1.699 | 1.655 | 1.617 |
| 0.507999999999784 | 1.706 | 1.662 | 1.624 |
| 0.511999999999784 | 1.712 | 1.669 | 1.63 |
| 0.515999999999784 | 1.719 | 1.675 | 1.637 |
| 0.519999999999784 | 1.725 | 1.682 | 1.644 |
| 0.523999999999784 | 1.732 | 1.689 | 1.651 |
| 0.527999999999784 | 1.738 | 1.696 | 1.658 |
| 0.531999999999784 | 1.745 | 1.702 | 1.665 |
| 0.535999999999784 | 1.752 | 1.709 | 1.672 |
| 0.539999999999784 | 1.758 | 1.716 | 1.679 |
| 0.543999999999784 | 1.765 | 1.723 | 1.686 |
| 0.547999999999784 | 1.772 | 1.73 | 1.693 |
| 0.551999999999784 | 1.778 | 1.737 | 1.7 |
| 0.555999999999784 | 1.785 | 1.744 | 1.707 |
| 0.559999999999784 | 1.792 | 1.751 | 1.715 |
| 0.563999999999784 | 1.799 | 1.758 | 1.722 |
| 0.567999999999784 | 1.806 | 1.765 | 1.729 |
| 0.571999999999784 | 1.812 | 1.772 | 1.736 |
| 0.575999999999784 | 1.819 | 1.779 | 1.744 |
| 0.579999999999784 | 1.826 | 1.786 | 1.751 |
| 0.583999999999784 | 1.833 | 1.793 | 1.758 |
| 0.587999999999784 | 1.84 | 1.8 | 1.766 |
| 0.591999999999784 | 1.847 | 1.808 | 1.773 |
| 0.595999999999784 | 1.854 | 1.815 | 1.781 |
| 0.599999999999784 | 1.861 | 1.822 | 1.788 |
| 0.603999999999784 | 1.868 | 1.829 | 1.796 |
| 0.607999999999784 | 1.876 | 1.837 | 1.803 |
| 0.611999999999784 | 1.883 | 1.844 | 1.811 |
| 0.615999999999784 | 1.89 | 1.852 | 1.818 |
| 0.619999999999784 | 1.897 | 1.859 | 1.826 |
| 0.623999999999784 | 1.904 | 1.866 | 1.834 |
| 0.627999999999784 | 1.912 | 1.874 | 1.842 |
| 0.631999999999784 | 1.919 | 1.881 | 1.849 |
| 0.635999999999784 | 1.926 | 1.889 | 1.857 |
| 0.639999999999784 | 1.933 | 1.896 | 1.865 |
| 0.643999999999784 | 1.941 | 1.904 | 1.873 |
| 0.647999999999784 | 1.948 | 1.912 | 1.881 |
| 0.651999999999784 | 1.956 | 1.919 | 1.889 |
| 0.655999999999784 | 1.963 | 1.927 | 1.896 |
| 0.659999999999784 | 1.971 | 1.935 | 1.904 |
| 0.663999999999784 | 1.978 | 1.943 | 1.912 |
| 0.667999999999784 | 1.986 | 1.95 | 1.921 |
| 0.671999999999784 | 1.993 | 1.958 | 1.929 |
| 0.675999999999784 | 2.001 | 1.966 | 1.937 |
| 0.679999999999784 | 2.008 | 1.974 | 1.945 |
| 0.683999999999784 | 2.016 | 1.982 | 1.953 |
| 0.687999999999784 | 2.024 | 1.99 | 1.961 |
| 0.691999999999784 | 2.031 | 1.998 | 1.97 |
| 0.695999999999784 | 2.039 | 2.006 | 1.978 |
| 0.699999999999784 | 2.047 | 2.014 | 1.986 |
| 0.703999999999784 | 2.055 | 2.022 | 1.995 |
| 0.707999999999784 | 2.062 | 2.03 | 2.003 |
| 0.711999999999784 | 2.07 | 2.038 | 2.011 |
| 0.715999999999784 | 2.078 | 2.046 | 2.02 |
| 0.719999999999784 | 2.086 | 2.054 | 2.028 |
| 0.723999999999784 | 2.094 | 2.063 | 2.037 |
| 0.727999999999784 | 2.102 | 2.071 | 2.045 |
| 0.731999999999784 | 2.11 | 2.079 | 2.054 |
| 0.735999999999784 | 2.118 | 2.088 | 2.063 |
| 0.739999999999784 | 2.126 | 2.096 | 2.071 |
| 0.743999999999784 | 2.134 | 2.104 | 2.08 |
| 0.747999999999784 | 2.142 | 2.113 | 2.089 |
| 0.751999999999784 | 2.15 | 2.121 | 2.098 |
| 0.755999999999784 | 2.159 | 2.13 | 2.106 |
| 0.759999999999784 | 2.167 | 2.138 | 2.115 |
| 0.763999999999784 | 2.175 | 2.147 | 2.124 |
| 0.767999999999784 | 2.183 | 2.155 | 2.133 |
| 0.771999999999784 | 2.192 | 2.164 | 2.142 |
| 0.775999999999784 | 2.2 | 2.173 | 2.151 |
| 0.779999999999784 | 2.208 | 2.181 | 2.16 |
| 0.783999999999784 | 2.217 | 2.19 | 2.169 |
| 0.787999999999784 | 2.225 | 2.199 | 2.178 |
| 0.791999999999784 | 2.234 | 2.208 | 2.188 |
| 0.795999999999784 | 2.242 | 2.217 | 2.197 |
| 0.799999999999784 | 2.251 | 2.226 | 2.206 |
| 0.803999999999784 | 2.259 | 2.234 | 2.215 |
| 0.807999999999784 | 2.268 | 2.243 | 2.225 |
| 0.811999999999784 | 2.277 | 2.252 | 2.234 |
| 0.815999999999784 | 2.285 | 2.261 | 2.243 |
| 0.819999999999784 | 2.294 | 2.27 | 2.253 |
| 0.823999999999784 | 2.303 | 2.28 | 2.262 |
| 0.827999999999784 | 2.311 | 2.289 | 2.272 |
| 0.831999999999784 | 2.32 | 2.298 | 2.281 |
| 0.835999999999784 | 2.329 | 2.307 | 2.291 |
| 0.839999999999784 | 2.338 | 2.316 | 2.301 |
| 0.843999999999784 | 2.347 | 2.326 | 2.31 |
| 0.847999999999784 | 2.356 | 2.335 | 2.32 |
| 0.851999999999784 | 2.365 | 2.344 | 2.33 |
| 0.855999999999784 | 2.374 | 2.354 | 2.34 |
| 0.859999999999784 | 2.383 | 2.363 | 2.35 |
| 0.863999999999784 | 2.392 | 2.373 | 2.359 |
| 0.867999999999784 | 2.401 | 2.382 | 2.369 |
| 0.871999999999784 | 2.41 | 2.392 | 2.379 |
| 0.875999999999784 | 2.419 | 2.401 | 2.389 |
| 0.879999999999784 | 2.429 | 2.411 | 2.399 |
| 0.883999999999784 | 2.438 | 2.421 | 2.409 |
| 0.887999999999784 | 2.447 | 2.43 | 2.42 |
| 0.891999999999784 | 2.456 | 2.44 | 2.43 |
| 0.895999999999784 | 2.466 | 2.45 | 2.44 |
| 0.899999999999784 | 2.475 | 2.46 | 2.45 |
| 0.903999999999784 | 2.485 | 2.469 | 2.461 |
| 0.907999999999784 | 2.494 | 2.479 | 2.471 |
| 0.911999999999784 | 2.504 | 2.489 | 2.481 |
| 0.915999999999784 | 2.513 | 2.499 | 2.492 |
| 0.919999999999784 | 2.523 | 2.509 | 2.502 |
| 0.923999999999784 | 2.532 | 2.519 | 2.513 |
| 0.927999999999784 | 2.542 | 2.529 | 2.523 |
| 0.931999999999784 | 2.552 | 2.54 | 2.534 |
| 0.935999999999784 | 2.561 | 2.55 | 2.545 |
| 0.939999999999784 | 2.571 | 2.56 | 2.555 |
| 0.943999999999784 | 2.581 | 2.57 | 2.566 |
| 0.947999999999784 | 2.591 | 2.581 | 2.577 |
| 0.951999999999784 | 2.6 | 2.591 | 2.588 |
| 0.955999999999784 | 2.61 | 2.601 | 2.599 |
| 0.959999999999784 | 2.62 | 2.612 | 2.61 |
| 0.963999999999784 | 2.63 | 2.622 | 2.621 |
| 0.967999999999784 | 2.64 | 2.633 | 2.632 |
| 0.971999999999784 | 2.65 | 2.643 | 2.643 |
| 0.975999999999784 | 2.66 | 2.654 | 2.654 |
| 0.979999999999784 | 2.671 | 2.664 | 2.665 |
| 0.983999999999784 | 2.681 | 2.675 | 2.676 |
| 0.987999999999784 | 2.691 | 2.686 | 2.687 |
| 0.991999999999784 | 2.701 | 2.697 | 2.699 |
| 0.995999999999784 | 2.711 | 2.707 | 2.71 |
| 0.999999999999784 | 2.722 | 2.718 | 2.722 |
| 1.003999999999784 | 2.732 | 2.729 | 2.733 |
| 1.007999999999784 | 2.743 | 2.74 | 2.745 |
| 1.011999999999784 | 2.753 | 2.751 | 2.756 |
| 1.015999999999784 | 2.763 | 2.762 | 2.768 |
| 1.019999999999784 | 2.774 | 2.773 | 2.779 |
| 1.023999999999784 | 2.785 | 2.784 | 2.791 |
| 1.027999999999784 | 2.795 | 2.795 | 2.803 |
| 1.031999999999784 | 2.806 | 2.807 | 2.815 |
| 1.035999999999784 | 2.816 | 2.818 | 2.826 |
| 1.039999999999784 | 2.827 | 2.829 | 2.838 |
| 1.043999999999784 | 2.838 | 2.841 | 2.85 |
| 1.047999999999784 | 2.849 | 2.852 | 2.862 |
| 1.051999999999784 | 2.86 | 2.863 | 2.874 |
| 1.055999999999784 | 2.871 | 2.875 | 2.886 |
| 1.059999999999784 | 2.881 | 2.886 | 2.899 |
| 1.063999999999784 | 2.892 | 2.898 | 2.911 |
| 1.067999999999784 | 2.903 | 2.91 | 2.923 |
| 1.071999999999784 | 2.914 | 2.921 | 2.935 |
| 1.075999999999784 | 2.926 | 2.933 | 2.948 |
| 1.079999999999784 | 2.937 | 2.945 | 2.96 |
| 1.083999999999784 | 2.948 | 2.956 | 2.973 |
| 1.087999999999784 | 2.959 | 2.968 | 2.985 |
| 1.091999999999784 | 2.97 | 2.98 | 2.998 |
| 1.095999999999784 | 2.982 | 2.992 | 3.01 |
| 1.099999999999784 | 2.993 | 3.004 | 3.023 |
| 1.103999999999784 | 3.004 | 3.016 | 3.036 |
| 1.107999999999784 | 3.016 | 3.028 | 3.048 |
| 1.111999999999784 | 3.027 | 3.04 | 3.061 |
| 1.115999999999784 | 3.039 | 3.053 | 3.074 |
| 1.119999999999784 | 3.05 | 3.065 | 3.087 |
| 1.123999999999784 | 3.062 | 3.077 | 3.1 |
| 1.127999999999784 | 3.074 | 3.089 | 3.113 |
| 1.131999999999784 | 3.085 | 3.102 | 3.126 |
| 1.135999999999784 | 3.097 | 3.114 | 3.139 |
| 1.139999999999784 | 3.109 | 3.127 | 3.153 |
| 1.143999999999784 | 3.121 | 3.139 | 3.166 |
| 1.147999999999784 | 3.133 | 3.152 | 3.179 |
| 1.151999999999784 | 3.145 | 3.165 | 3.193 |
| 1.155999999999784 | 3.157 | 3.177 | 3.206 |
| 1.159999999999784 | 3.169 | 3.19 | 3.219 |
| 1.163999999999784 | 3.181 | 3.203 | 3.233 |
| 1.167999999999784 | 3.193 | 3.216 | 3.247 |
| 1.171999999999784 | 3.205 | 3.228 | 3.26 |
| 1.175999999999784 | 3.217 | 3.241 | 3.274 |
| 1.179999999999784 | 3.229 | 3.254 | 3.288 |
| 1.183999999999784 | 3.242 | 3.267 | 3.302 |
| 1.187999999999784 | 3.254 | 3.281 | 3.316 |
| 1.191999999999784 | 3.266 | 3.294 | 3.329 |
| 1.195999999999784 | 3.279 | 3.307 | 3.343 |
| 1.199999999999784 | 3.291 | 3.32 | 3.358 |
| 1.203999999999784 | 3.304 | 3.333 | 3.372 |
| 1.207999999999784 | 3.316 | 3.347 | 3.386 |
| 1.211999999999784 | 3.329 | 3.36 | 3.4 |
| 1.215999999999784 | 3.342 | 3.374 | 3.414 |
| 1.219999999999784 | 3.354 | 3.387 | 3.429 |
| 1.223999999999784 | 3.367 | 3.401 | 3.443 |
| 1.227999999999784 | 3.38 | 3.414 | 3.458 |
| 1.231999999999784 | 3.393 | 3.428 | 3.472 |
| 1.235999999999784 | 3.406 | 3.442 | 3.487 |
| 1.239999999999784 | 3.419 | 3.456 | 3.502 |
| 1.243999999999784 | 3.432 | 3.469 | 3.516 |
| 1.247999999999784 | 3.445 | 3.483 | 3.531 |
| 1.251999999999784 | 3.458 | 3.497 | 3.546 |
| 1.255999999999784 | 3.471 | 3.511 | 3.561 |
| 1.259999999999784 | 3.484 | 3.525 | 3.576 |
| 1.263999999999784 | 3.498 | 3.54 | 3.591 |
| 1.267999999999784 | 3.511 | 3.554 | 3.606 |
| 1.271999999999784 | 3.524 | 3.568 | 3.621 |
| 1.275999999999784 | 3.538 | 3.582 | 3.636 |
| 1.279999999999784 | 3.551 | 3.597 | 3.652 |
| 1.283999999999784 | 3.565 | 3.611 | 3.667 |
| 1.287999999999784 | 3.578 | 3.626 | 3.683 |
| 1.291999999999784 | 3.592 | 3.64 | 3.698 |
| 1.295999999999784 | 3.606 | 3.655 | 3.714 |
| 1.299999999999784 | 3.619 | 3.669 | 3.729 |
| 1.303999999999784 | 3.633 | 3.684 | 3.745 |
| 1.307999999999784 | 3.647 | 3.699 | 3.761 |
| 1.311999999999784 | 3.661 | 3.714 | 3.777 |
| 1.315999999999784 | 3.675 | 3.728 | 3.792 |
| 1.319999999999784 | 3.689 | 3.743 | 3.808 |
| 1.323999999999784 | 3.703 | 3.758 | 3.824 |
| 1.327999999999784 | 3.717 | 3.773 | 3.841 |
| 1.331999999999784 | 3.731 | 3.789 | 3.857 |
| 1.335999999999784 | 3.745 | 3.804 | 3.873 |
| 1.339999999999784 | 3.76 | 3.819 | 3.889 |
| 1.343999999999784 | 3.774 | 3.834 | 3.906 |
| 1.347999999999784 | 3.788 | 3.85 | 3.922 |
| 1.351999999999784 | 3.803 | 3.865 | 3.939 |
| 1.355999999999784 | 3.817 | 3.881 | 3.955 |
| 1.359999999999784 | 3.832 | 3.896 | 3.972 |
| 1.363999999999784 | 3.846 | 3.912 | 3.988 |
| 1.367999999999784 | 3.861 | 3.927 | 4.005 |
| 1.371999999999784 | 3.876 | 3.943 | 4.022 |
| 1.375999999999784 | 3.89 | 3.959 | 4.039 |
| 1.379999999999784 | 3.905 | 3.975 | 4.056 |
| 1.383999999999784 | 3.92 | 3.991 | 4.073 |
| 1.387999999999784 | 3.935 | 4.007 | 4.09 |
| 1.391999999999784 | 3.95 | 4.023 | 4.107 |
| 1.395999999999784 | 3.965 | 4.039 | 4.125 |
| 1.399999999999784 | 3.98 | 4.055 | 4.142 |
| 1.403999999999784 | 3.995 | 4.071 | 4.16 |
| 1.407999999999784 | 4.01 | 4.088 | 4.177 |
| 1.411999999999784 | 4.026 | 4.104 | 4.195 |
| 1.415999999999784 | 4.041 | 4.121 | 4.212 |
| 1.419999999999784 | 4.056 | 4.137 | 4.23 |
| 1.423999999999784 | 4.072 | 4.154 | 4.248 |
| 1.427999999999784 | 4.087 | 4.17 | 4.266 |
| 1.431999999999784 | 4.103 | 4.187 | 4.284 |
| 1.435999999999784 | 4.119 | 4.204 | 4.302 |
| 1.439999999999784 | 4.134 | 4.221 | 4.32 |
| 1.443999999999784 | 4.15 | 4.238 | 4.338 |
| 1.447999999999784 | 4.166 | 4.255 | 4.356 |
| 1.451999999999784 | 4.182 | 4.272 | 4.375 |
| 1.455999999999784 | 4.198 | 4.289 | 4.393 |
| 1.459999999999784 | 4.213 | 4.306 | 4.411 |
| 1.463999999999784 | 4.23 | 4.323 | 4.43 |
| 1.467999999999784 | 4.246 | 4.341 | 4.449 |
| 1.471999999999784 | 4.262 | 4.358 | 4.467 |
| 1.475999999999784 | 4.278 | 4.375 | 4.486 |
| 1.479999999999784 | 4.294 | 4.393 | 4.505 |
| 1.483999999999784 | 4.311 | 4.411 | 4.524 |
| 1.487999999999784 | 4.327 | 4.428 | 4.543 |
| 1.491999999999784 | 4.344 | 4.446 | 4.562 |
| 1.495999999999784 | 4.36 | 4.464 | 4.581 |
| 1.499999999999784 | 4.377 | 4.482 | 4.601 |
| 1.503999999999784 | 4.393 | 4.5 | 4.62 |
| 1.507999999999784 | 4.41 | 4.518 | 4.64 |
| 1.511999999999784 | 4.427 | 4.536 | 4.659 |
| 1.515999999999784 | 4.444 | 4.554 | 4.679 |
| 1.519999999999784 | 4.461 | 4.572 | 4.698 |
| 1.523999999999784 | 4.478 | 4.591 | 4.718 |
| 1.527999999999784 | 4.495 | 4.609 | 4.738 |
| 1.531999999999784 | 4.512 | 4.627 | 4.758 |
| 1.535999999999784 | 4.529 | 4.646 | 4.778 |
| 1.539999999999784 | 4.546 | 4.665 | 4.798 |
| 1.543999999999784 | 4.564 | 4.683 | 4.818 |
| 1.547999999999784 | 4.581 | 4.702 | 4.839 |
| 1.551999999999784 | 4.598 | 4.721 | 4.859 |
| 1.555999999999784 | 4.616 | 4.74 | 4.879 |
| 1.559999999999784 | 4.633 | 4.759 | 4.9 |
| 1.563999999999784 | 4.651 | 4.778 | 4.92 |
| 1.567999999999784 | 4.669 | 4.797 | 4.941 |
| 1.571999999999784 | 4.687 | 4.816 | 4.962 |
| 1.575999999999784 | 4.704 | 4.836 | 4.983 |
| 1.579999999999784 | 4.722 | 4.855 | 5.004 |
| 1.583999999999784 | 4.74 | 4.874 | 5.025 |
| 1.587999999999784 | 4.758 | 4.894 | 5.046 |
| 1.591999999999784 | 4.776 | 4.914 | 5.067 |
| 1.595999999999784 | 4.795 | 4.933 | 5.089 |
| 1.599999999999784 | 4.813 | 4.953 | 5.11 |
| 1.603999999999784 | 4.831 | 4.973 | 5.132 |
| 1.607999999999784 | 4.85 | 4.993 | 5.153 |
| 1.611999999999784 | 4.868 | 5.013 | 5.175 |
| 1.615999999999784 | 4.887 | 5.033 | 5.197 |
| 1.619999999999784 | 4.905 | 5.053 | 5.218 |
| 1.623999999999784 | 4.924 | 5.073 | 5.24 |
| 1.627999999999784 | 4.943 | 5.094 | 5.263 |
| 1.631999999999784 | 4.961 | 5.114 | 5.285 |
| 1.635999999999784 | 4.98 | 5.135 | 5.307 |
| 1.639999999999784 | 4.999 | 5.155 | 5.329 |
| 1.643999999999784 | 5.018 | 5.176 | 5.352 |
| 1.647999999999784 | 5.037 | 5.197 | 5.374 |
| 1.651999999999784 | 5.057 | 5.217 | 5.397 |
| 1.655999999999784 | 5.076 | 5.238 | 5.42 |
| 1.659999999999784 | 5.095 | 5.259 | 5.442 |
| 1.663999999999784 | 5.115 | 5.28 | 5.465 |
| 1.667999999999784 | 5.134 | 5.302 | 5.488 |
| 1.671999999999784 | 5.154 | 5.323 | 5.511 |
| 1.675999999999784 | 5.173 | 5.344 | 5.535 |
| 1.679999999999784 | 5.193 | 5.366 | 5.558 |
| 1.683999999999784 | 5.213 | 5.387 | 5.581 |
| 1.687999999999784 | 5.233 | 5.409 | 5.605 |
| 1.691999999999784 | 5.252 | 5.43 | 5.628 |
| 1.695999999999784 | 5.272 | 5.452 | 5.652 |
| 1.699999999999784 | 5.293 | 5.474 | 5.676 |
| 1.703999999999785 | 5.313 | 5.496 | 5.7 |
| 1.707999999999785 | 5.333 | 5.518 | 5.724 |
| 1.711999999999785 | 5.353 | 5.54 | 5.748 |
| 1.715999999999785 | 5.374 | 5.562 | 5.772 |
| 1.719999999999785 | 5.394 | 5.585 | 5.796 |
| 1.723999999999785 | 5.415 | 5.607 | 5.821 |
| 1.727999999999785 | 5.435 | 5.629 | 5.845 |
| 1.731999999999785 | 5.456 | 5.652 | 5.87 |
| 1.735999999999785 | 5.477 | 5.675 | 5.894 |
| 1.739999999999785 | 5.497 | 5.697 | 5.919 |
| 1.743999999999785 | 5.518 | 5.72 | 5.944 |
| 1.747999999999785 | 5.539 | 5.743 | 5.969 |
| 1.751999999999785 | 5.561 | 5.766 | 5.994 |
| 1.755999999999785 | 5.582 | 5.789 | 6.02 |
| 1.759999999999785 | 5.603 | 5.812 | 6.045 |
| 1.763999999999785 | 5.624 | 5.836 | 6.07 |
| 1.767999999999785 | 5.646 | 5.859 | 6.096 |
| 1.771999999999785 | 5.667 | 5.883 | 6.122 |
| 1.775999999999785 | 5.689 | 5.906 | 6.147 |
| 1.779999999999785 | 5.71 | 5.93 | 6.173 |
| 1.783999999999785 | 5.732 | 5.954 | 6.199 |
| 1.787999999999785 | 5.754 | 5.977 | 6.225 |
| 1.791999999999785 | 5.776 | 6.001 | 6.251 |
| 1.795999999999785 | 5.798 | 6.025 | 6.278 |
| 1.799999999999785 | 5.82 | 6.05 | 6.304 |
| 1.803999999999785 | 5.842 | 6.074 | 6.331 |
| 1.807999999999785 | 5.864 | 6.098 | 6.357 |
| 1.811999999999785 | 5.887 | 6.123 | 6.384 |
| 1.815999999999785 | 5.909 | 6.147 | 6.411 |
| 1.819999999999785 | 5.932 | 6.172 | 6.438 |
| 1.823999999999785 | 5.954 | 6.197 | 6.465 |
| 1.827999999999785 | 5.977 | 6.221 | 6.492 |
| 1.831999999999785 | 6 | 6.246 | 6.52 |
| 1.835999999999785 | 6.022 | 6.271 | 6.547 |
| 1.839999999999785 | 6.045 | 6.297 | 6.575 |
| 1.843999999999785 | 6.068 | 6.322 | 6.602 |
| 1.847999999999785 | 6.091 | 6.347 | 6.63 |
| 1.851999999999785 | 6.115 | 6.373 | 6.658 |
| 1.855999999999785 | 6.138 | 6.398 | 6.686 |
| 1.859999999999785 | 6.161 | 6.424 | 6.714 |
| 1.863999999999785 | 6.185 | 6.449 | 6.742 |
| 1.867999999999785 | 6.208 | 6.475 | 6.771 |
| 1.871999999999785 | 6.232 | 6.501 | 6.799 |
| 1.875999999999785 | 6.256 | 6.527 | 6.828 |
| 1.879999999999785 | 6.28 | 6.554 | 6.857 |
| 1.883999999999785 | 6.303 | 6.58 | 6.885 |
| 1.887999999999785 | 6.327 | 6.606 | 6.914 |
| 1.891999999999785 | 6.352 | 6.633 | 6.944 |
| 1.895999999999785 | 6.376 | 6.659 | 6.973 |
| 1.899999999999785 | 6.4 | 6.686 | 7.002 |
| 1.903999999999785 | 6.424 | 6.713 | 7.032 |
| 1.907999999999785 | 6.449 | 6.74 | 7.061 |
| 1.911999999999785 | 6.473 | 6.767 | 7.091 |
| 1.915999999999785 | 6.498 | 6.794 | 7.121 |
| 1.919999999999785 | 6.523 | 6.821 | 7.151 |
| 1.923999999999785 | 6.548 | 6.848 | 7.181 |
| 1.927999999999785 | 6.572 | 6.876 | 7.211 |
| 1.931999999999785 | 6.598 | 6.903 | 7.241 |
| 1.935999999999785 | 6.623 | 6.931 | 7.272 |
| 1.939999999999785 | 6.648 | 6.959 | 7.302 |
| 1.943999999999785 | 6.673 | 6.987 | 7.333 |
| 1.947999999999785 | 6.699 | 7.015 | 7.364 |
| 1.951999999999785 | 6.724 | 7.043 | 7.395 |
| 1.955999999999785 | 6.75 | 7.071 | 7.426 |
| 1.959999999999785 | 6.775 | 7.099 | 7.457 |
| 1.963999999999785 | 6.801 | 7.128 | 7.489 |
| 1.967999999999785 | 6.827 | 7.156 | 7.52 |
| 1.971999999999785 | 6.853 | 7.185 | 7.552 |
| 1.975999999999785 | 6.879 | 7.214 | 7.584 |
| 1.979999999999785 | 6.905 | 7.243 | 7.616 |
| 1.983999999999785 | 6.932 | 7.272 | 7.648 |
| 1.987999999999785 | 6.958 | 7.301 | 7.68 |
| 1.991999999999785 | 6.984 | 7.33 | 7.712 |
| 1.995999999999785 | 7.011 | 7.36 | 7.745 |
| 1.999999999999785 | 7.038 | 7.389 | 7.777 |